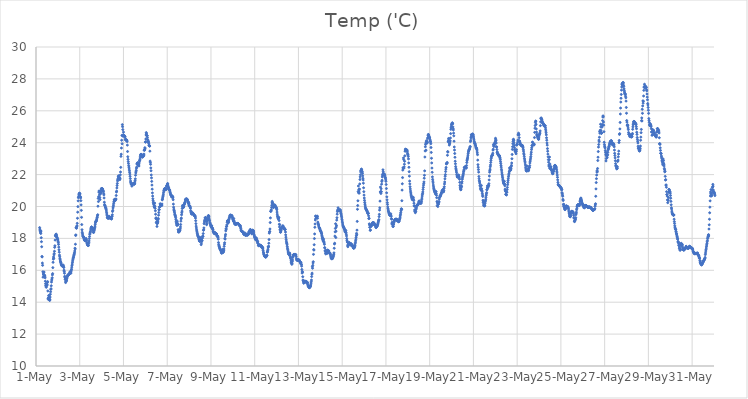
| Category | Temp ('C) |
|---|---|
| 44317.166666666664 | 18.677 |
| 44317.177083333336 | 18.579 |
| 44317.1875 | 18.491 |
| 44317.197916666664 | 18.44 |
| 44317.208333333336 | 18.362 |
| 44317.21875 | 18.308 |
| 44317.229166666664 | 18.458 |
| 44317.239583333336 | 18.043 |
| 44317.25 | 17.794 |
| 44317.260416666664 | 17.476 |
| 44317.270833333336 | 16.867 |
| 44317.28125 | 16.838 |
| 44317.291666666664 | 16.454 |
| 44317.302083333336 | 16.313 |
| 44317.3125 | 15.905 |
| 44317.322916666664 | 15.569 |
| 44317.333333333336 | 15.77 |
| 44317.34375 | 15.732 |
| 44317.354166666664 | 15.859 |
| 44317.364583333336 | 15.897 |
| 44317.375 | 15.663 |
| 44317.385416666664 | 15.684 |
| 44317.395833333336 | 15.685 |
| 44317.40625 | 15.631 |
| 44317.416666666664 | 15.531 |
| 44317.427083333336 | 15.315 |
| 44317.4375 | 15.16 |
| 44317.447916666664 | 15.05 |
| 44317.458333333336 | 15.002 |
| 44317.46875 | 14.934 |
| 44317.479166666664 | 15.065 |
| 44317.489583333336 | 15.076 |
| 44317.5 | 15.052 |
| 44317.510416666664 | 15.119 |
| 44317.520833333336 | 15.241 |
| 44317.53125 | 15.29 |
| 44317.541666666664 | 14.705 |
| 44317.552083333336 | 14.24 |
| 44317.5625 | 14.177 |
| 44317.572916666664 | 14.291 |
| 44317.583333333336 | 14.421 |
| 44317.59375 | 14.397 |
| 44317.604166666664 | 14.224 |
| 44317.614583333336 | 14.148 |
| 44317.625 | 14.11 |
| 44317.635416666664 | 14.159 |
| 44317.645833333336 | 14.323 |
| 44317.65625 | 14.5 |
| 44317.666666666664 | 14.655 |
| 44317.677083333336 | 14.805 |
| 44317.6875 | 14.842 |
| 44317.697916666664 | 15.029 |
| 44317.708333333336 | 15.264 |
| 44317.71875 | 15.386 |
| 44317.729166666664 | 15.455 |
| 44317.739583333336 | 15.531 |
| 44317.75 | 15.712 |
| 44317.760416666664 | 15.792 |
| 44317.770833333336 | 16.167 |
| 44317.78125 | 16.5 |
| 44317.791666666664 | 16.7 |
| 44317.802083333336 | 16.832 |
| 44317.8125 | 16.751 |
| 44317.822916666664 | 16.969 |
| 44317.833333333336 | 17.05 |
| 44317.84375 | 17.194 |
| 44317.854166666664 | 17.439 |
| 44317.864583333336 | 17.538 |
| 44317.875 | 17.896 |
| 44317.885416666664 | 18.163 |
| 44317.895833333336 | 18.164 |
| 44317.90625 | 18.252 |
| 44317.916666666664 | 18.205 |
| 44317.927083333336 | 18.265 |
| 44317.9375 | 18.192 |
| 44317.947916666664 | 18.086 |
| 44317.958333333336 | 18.078 |
| 44317.96875 | 18.038 |
| 44317.979166666664 | 17.96 |
| 44317.989583333336 | 17.947 |
| 44318.0 | 17.897 |
| 44318.010416666664 | 17.813 |
| 44318.020833333336 | 17.74 |
| 44318.03125 | 17.624 |
| 44318.041666666664 | 17.453 |
| 44318.052083333336 | 17.288 |
| 44318.0625 | 17.136 |
| 44318.072916666664 | 16.953 |
| 44318.083333333336 | 16.853 |
| 44318.09375 | 16.735 |
| 44318.104166666664 | 16.659 |
| 44318.114583333336 | 16.578 |
| 44318.125 | 16.524 |
| 44318.135416666664 | 16.486 |
| 44318.145833333336 | 16.436 |
| 44318.15625 | 16.375 |
| 44318.166666666664 | 16.337 |
| 44318.177083333336 | 16.293 |
| 44318.1875 | 16.278 |
| 44318.197916666664 | 16.284 |
| 44318.208333333336 | 16.29 |
| 44318.21875 | 16.282 |
| 44318.229166666664 | 16.273 |
| 44318.239583333336 | 16.264 |
| 44318.25 | 16.321 |
| 44318.260416666664 | 16.212 |
| 44318.270833333336 | 16.175 |
| 44318.28125 | 16.006 |
| 44318.291666666664 | 15.925 |
| 44318.302083333336 | 15.816 |
| 44318.3125 | 15.622 |
| 44318.322916666664 | 15.561 |
| 44318.333333333336 | 15.423 |
| 44318.34375 | 15.464 |
| 44318.354166666664 | 15.23 |
| 44318.364583333336 | 15.313 |
| 44318.375 | 15.311 |
| 44318.385416666664 | 15.379 |
| 44318.395833333336 | 15.35 |
| 44318.40625 | 15.462 |
| 44318.416666666664 | 15.514 |
| 44318.427083333336 | 15.584 |
| 44318.4375 | 15.651 |
| 44318.447916666664 | 15.689 |
| 44318.458333333336 | 15.677 |
| 44318.46875 | 15.707 |
| 44318.479166666664 | 15.693 |
| 44318.489583333336 | 15.729 |
| 44318.5 | 15.754 |
| 44318.510416666664 | 15.754 |
| 44318.520833333336 | 15.782 |
| 44318.53125 | 15.784 |
| 44318.541666666664 | 15.826 |
| 44318.552083333336 | 15.865 |
| 44318.5625 | 15.91 |
| 44318.572916666664 | 15.917 |
| 44318.583333333336 | 15.834 |
| 44318.59375 | 15.816 |
| 44318.604166666664 | 15.905 |
| 44318.614583333336 | 16.013 |
| 44318.625 | 16.072 |
| 44318.635416666664 | 16.198 |
| 44318.645833333336 | 16.305 |
| 44318.65625 | 16.391 |
| 44318.666666666664 | 16.498 |
| 44318.677083333336 | 16.594 |
| 44318.6875 | 16.686 |
| 44318.697916666664 | 16.755 |
| 44318.708333333336 | 16.8 |
| 44318.71875 | 16.843 |
| 44318.729166666664 | 16.929 |
| 44318.739583333336 | 16.977 |
| 44318.75 | 17.029 |
| 44318.760416666664 | 17.102 |
| 44318.770833333336 | 17.208 |
| 44318.78125 | 17.385 |
| 44318.791666666664 | 17.338 |
| 44318.802083333336 | 17.634 |
| 44318.8125 | 18.183 |
| 44318.822916666664 | 18.221 |
| 44318.833333333336 | 18.662 |
| 44318.84375 | 18.688 |
| 44318.854166666664 | 18.637 |
| 44318.864583333336 | 18.755 |
| 44318.875 | 18.792 |
| 44318.885416666664 | 18.944 |
| 44318.895833333336 | 19.263 |
| 44318.90625 | 19.645 |
| 44318.916666666664 | 19.993 |
| 44318.927083333336 | 20.353 |
| 44318.9375 | 20.553 |
| 44318.947916666664 | 20.607 |
| 44318.958333333336 | 20.723 |
| 44318.96875 | 20.783 |
| 44318.979166666664 | 20.824 |
| 44318.989583333336 | 20.832 |
| 44319.0 | 20.809 |
| 44319.010416666664 | 20.782 |
| 44319.020833333336 | 20.631 |
| 44319.03125 | 20.591 |
| 44319.041666666664 | 20.541 |
| 44319.052083333336 | 20.365 |
| 44319.0625 | 20.101 |
| 44319.072916666664 | 19.757 |
| 44319.083333333336 | 19.32 |
| 44319.09375 | 18.866 |
| 44319.104166666664 | 18.545 |
| 44319.114583333336 | 18.383 |
| 44319.125 | 18.288 |
| 44319.135416666664 | 18.203 |
| 44319.145833333336 | 18.134 |
| 44319.15625 | 18.099 |
| 44319.166666666664 | 18.102 |
| 44319.177083333336 | 18.084 |
| 44319.1875 | 18.035 |
| 44319.197916666664 | 17.977 |
| 44319.208333333336 | 17.935 |
| 44319.21875 | 17.895 |
| 44319.229166666664 | 17.867 |
| 44319.239583333336 | 17.864 |
| 44319.25 | 17.877 |
| 44319.260416666664 | 17.89 |
| 44319.270833333336 | 17.885 |
| 44319.28125 | 17.949 |
| 44319.291666666664 | 17.996 |
| 44319.302083333336 | 17.928 |
| 44319.3125 | 17.847 |
| 44319.322916666664 | 17.727 |
| 44319.333333333336 | 17.703 |
| 44319.34375 | 17.642 |
| 44319.354166666664 | 17.605 |
| 44319.364583333336 | 17.581 |
| 44319.375 | 17.579 |
| 44319.385416666664 | 17.561 |
| 44319.395833333336 | 17.553 |
| 44319.40625 | 17.673 |
| 44319.416666666664 | 17.75 |
| 44319.427083333336 | 17.842 |
| 44319.4375 | 17.986 |
| 44319.447916666664 | 18.115 |
| 44319.458333333336 | 18.254 |
| 44319.46875 | 18.324 |
| 44319.479166666664 | 18.389 |
| 44319.489583333336 | 18.428 |
| 44319.5 | 18.527 |
| 44319.510416666664 | 18.611 |
| 44319.520833333336 | 18.664 |
| 44319.53125 | 18.704 |
| 44319.541666666664 | 18.713 |
| 44319.552083333336 | 18.701 |
| 44319.5625 | 18.656 |
| 44319.572916666664 | 18.643 |
| 44319.583333333336 | 18.632 |
| 44319.59375 | 18.598 |
| 44319.604166666664 | 18.564 |
| 44319.614583333336 | 18.493 |
| 44319.625 | 18.376 |
| 44319.635416666664 | 18.375 |
| 44319.645833333336 | 18.45 |
| 44319.65625 | 18.518 |
| 44319.666666666664 | 18.536 |
| 44319.677083333336 | 18.616 |
| 44319.6875 | 18.69 |
| 44319.697916666664 | 18.769 |
| 44319.708333333336 | 18.888 |
| 44319.71875 | 18.988 |
| 44319.729166666664 | 19.05 |
| 44319.739583333336 | 19.078 |
| 44319.75 | 19.083 |
| 44319.760416666664 | 19.105 |
| 44319.770833333336 | 19.162 |
| 44319.78125 | 19.225 |
| 44319.791666666664 | 19.309 |
| 44319.802083333336 | 19.344 |
| 44319.8125 | 19.441 |
| 44319.822916666664 | 19.482 |
| 44319.833333333336 | 20.018 |
| 44319.84375 | 20.508 |
| 44319.854166666664 | 20.31 |
| 44319.864583333336 | 20.626 |
| 44319.875 | 20.895 |
| 44319.885416666664 | 20.977 |
| 44319.895833333336 | 20.927 |
| 44319.90625 | 20.754 |
| 44319.916666666664 | 20.564 |
| 44319.927083333336 | 20.433 |
| 44319.9375 | 20.772 |
| 44319.947916666664 | 20.917 |
| 44319.958333333336 | 20.886 |
| 44319.96875 | 20.849 |
| 44319.979166666664 | 21.02 |
| 44319.989583333336 | 21.128 |
| 44320.0 | 21.114 |
| 44320.010416666664 | 21.084 |
| 44320.020833333336 | 21.124 |
| 44320.03125 | 21.116 |
| 44320.041666666664 | 21.102 |
| 44320.052083333336 | 21.043 |
| 44320.0625 | 20.99 |
| 44320.072916666664 | 20.975 |
| 44320.083333333336 | 20.918 |
| 44320.09375 | 20.801 |
| 44320.104166666664 | 20.729 |
| 44320.114583333336 | 20.535 |
| 44320.125 | 20.269 |
| 44320.135416666664 | 20.121 |
| 44320.145833333336 | 20.07 |
| 44320.15625 | 20.044 |
| 44320.166666666664 | 19.972 |
| 44320.177083333336 | 19.944 |
| 44320.1875 | 19.924 |
| 44320.197916666664 | 19.878 |
| 44320.208333333336 | 19.812 |
| 44320.21875 | 19.718 |
| 44320.229166666664 | 19.61 |
| 44320.239583333336 | 19.522 |
| 44320.25 | 19.435 |
| 44320.260416666664 | 19.324 |
| 44320.270833333336 | 19.288 |
| 44320.28125 | 19.284 |
| 44320.291666666664 | 19.274 |
| 44320.302083333336 | 19.283 |
| 44320.3125 | 19.277 |
| 44320.322916666664 | 19.271 |
| 44320.333333333336 | 19.36 |
| 44320.34375 | 19.387 |
| 44320.354166666664 | 19.316 |
| 44320.364583333336 | 19.313 |
| 44320.375 | 19.285 |
| 44320.385416666664 | 19.27 |
| 44320.395833333336 | 19.291 |
| 44320.40625 | 19.252 |
| 44320.416666666664 | 19.254 |
| 44320.427083333336 | 19.253 |
| 44320.4375 | 19.226 |
| 44320.447916666664 | 19.226 |
| 44320.458333333336 | 19.234 |
| 44320.46875 | 19.36 |
| 44320.479166666664 | 19.395 |
| 44320.489583333336 | 19.482 |
| 44320.5 | 19.687 |
| 44320.510416666664 | 19.761 |
| 44320.520833333336 | 19.908 |
| 44320.53125 | 19.987 |
| 44320.541666666664 | 20.087 |
| 44320.552083333336 | 20.202 |
| 44320.5625 | 20.301 |
| 44320.572916666664 | 20.415 |
| 44320.583333333336 | 20.336 |
| 44320.59375 | 20.447 |
| 44320.604166666664 | 20.435 |
| 44320.614583333336 | 20.41 |
| 44320.625 | 20.374 |
| 44320.635416666664 | 20.441 |
| 44320.645833333336 | 20.44 |
| 44320.65625 | 20.475 |
| 44320.666666666664 | 20.691 |
| 44320.677083333336 | 20.911 |
| 44320.6875 | 20.962 |
| 44320.697916666664 | 21.162 |
| 44320.708333333336 | 21.315 |
| 44320.71875 | 21.445 |
| 44320.729166666664 | 21.605 |
| 44320.739583333336 | 21.681 |
| 44320.75 | 21.749 |
| 44320.760416666664 | 21.86 |
| 44320.770833333336 | 21.924 |
| 44320.78125 | 21.859 |
| 44320.791666666664 | 21.853 |
| 44320.802083333336 | 21.812 |
| 44320.8125 | 21.754 |
| 44320.822916666664 | 21.737 |
| 44320.833333333336 | 21.684 |
| 44320.84375 | 21.77 |
| 44320.854166666664 | 21.981 |
| 44320.864583333336 | 22.164 |
| 44320.875 | 22.454 |
| 44320.885416666664 | 23.143 |
| 44320.895833333336 | 23.278 |
| 44320.90625 | 23.666 |
| 44320.916666666664 | 24.155 |
| 44320.927083333336 | 24.455 |
| 44320.9375 | 23.933 |
| 44320.947916666664 | 25.132 |
| 44320.958333333336 | 25.004 |
| 44320.96875 | 24.82 |
| 44320.979166666664 | 24.402 |
| 44320.989583333336 | 24.502 |
| 44321.0 | 24.663 |
| 44321.010416666664 | 24.446 |
| 44321.020833333336 | 24.422 |
| 44321.03125 | 24.451 |
| 44321.041666666664 | 24.435 |
| 44321.052083333336 | 24.402 |
| 44321.0625 | 24.389 |
| 44321.072916666664 | 24.359 |
| 44321.083333333336 | 24.22 |
| 44321.09375 | 24.177 |
| 44321.104166666664 | 24.178 |
| 44321.114583333336 | 24.172 |
| 44321.125 | 24.174 |
| 44321.135416666664 | 24.173 |
| 44321.145833333336 | 24.166 |
| 44321.15625 | 24.148 |
| 44321.166666666664 | 24.072 |
| 44321.177083333336 | 23.848 |
| 44321.1875 | 23.449 |
| 44321.197916666664 | 23.119 |
| 44321.208333333336 | 22.955 |
| 44321.21875 | 22.814 |
| 44321.229166666664 | 22.693 |
| 44321.239583333336 | 22.56 |
| 44321.25 | 22.462 |
| 44321.260416666664 | 22.352 |
| 44321.270833333336 | 22.251 |
| 44321.28125 | 22.141 |
| 44321.291666666664 | 22.032 |
| 44321.302083333336 | 21.892 |
| 44321.3125 | 21.748 |
| 44321.322916666664 | 21.595 |
| 44321.333333333336 | 21.507 |
| 44321.34375 | 21.456 |
| 44321.354166666664 | 21.401 |
| 44321.364583333336 | 21.398 |
| 44321.375 | 21.366 |
| 44321.385416666664 | 21.275 |
| 44321.395833333336 | 21.412 |
| 44321.40625 | 21.395 |
| 44321.416666666664 | 21.391 |
| 44321.427083333336 | 21.398 |
| 44321.4375 | 21.415 |
| 44321.447916666664 | 21.427 |
| 44321.458333333336 | 21.424 |
| 44321.46875 | 21.44 |
| 44321.479166666664 | 21.41 |
| 44321.489583333336 | 21.396 |
| 44321.5 | 21.413 |
| 44321.510416666664 | 21.439 |
| 44321.520833333336 | 21.537 |
| 44321.53125 | 21.62 |
| 44321.541666666664 | 21.735 |
| 44321.552083333336 | 21.957 |
| 44321.5625 | 22.103 |
| 44321.572916666664 | 22.176 |
| 44321.583333333336 | 22.271 |
| 44321.59375 | 22.403 |
| 44321.604166666664 | 22.47 |
| 44321.614583333336 | 22.66 |
| 44321.625 | 22.694 |
| 44321.635416666664 | 22.725 |
| 44321.645833333336 | 22.744 |
| 44321.65625 | 22.654 |
| 44321.666666666664 | 22.621 |
| 44321.677083333336 | 22.605 |
| 44321.6875 | 22.601 |
| 44321.697916666664 | 22.612 |
| 44321.708333333336 | 22.54 |
| 44321.71875 | 22.728 |
| 44321.729166666664 | 22.849 |
| 44321.739583333336 | 22.884 |
| 44321.75 | 22.948 |
| 44321.760416666664 | 23.036 |
| 44321.770833333336 | 23.138 |
| 44321.78125 | 23.208 |
| 44321.791666666664 | 23.26 |
| 44321.802083333336 | 23.273 |
| 44321.8125 | 23.265 |
| 44321.822916666664 | 23.23 |
| 44321.833333333336 | 23.143 |
| 44321.84375 | 23.113 |
| 44321.854166666664 | 23.122 |
| 44321.864583333336 | 23.116 |
| 44321.875 | 23.105 |
| 44321.885416666664 | 23.114 |
| 44321.895833333336 | 23.165 |
| 44321.90625 | 23.252 |
| 44321.916666666664 | 23.164 |
| 44321.927083333336 | 23.198 |
| 44321.9375 | 23.284 |
| 44321.947916666664 | 23.52 |
| 44321.958333333336 | 23.567 |
| 44321.96875 | 23.542 |
| 44321.979166666664 | 23.687 |
| 44321.989583333336 | 23.618 |
| 44322.0 | 24.052 |
| 44322.010416666664 | 24.038 |
| 44322.020833333336 | 24.231 |
| 44322.03125 | 24.485 |
| 44322.041666666664 | 24.635 |
| 44322.052083333336 | 24.573 |
| 44322.0625 | 24.447 |
| 44322.072916666664 | 24.44 |
| 44322.083333333336 | 24.44 |
| 44322.09375 | 24.327 |
| 44322.104166666664 | 24.197 |
| 44322.114583333336 | 24.145 |
| 44322.125 | 24.108 |
| 44322.135416666664 | 24.06 |
| 44322.145833333336 | 24.029 |
| 44322.15625 | 23.945 |
| 44322.166666666664 | 23.843 |
| 44322.177083333336 | 23.824 |
| 44322.1875 | 23.8 |
| 44322.197916666664 | 23.785 |
| 44322.208333333336 | 23.47 |
| 44322.21875 | 22.845 |
| 44322.229166666664 | 22.761 |
| 44322.239583333336 | 22.645 |
| 44322.25 | 22.418 |
| 44322.260416666664 | 22.239 |
| 44322.270833333336 | 21.977 |
| 44322.28125 | 21.794 |
| 44322.291666666664 | 21.575 |
| 44322.302083333336 | 21.344 |
| 44322.3125 | 21.088 |
| 44322.322916666664 | 20.853 |
| 44322.333333333336 | 20.655 |
| 44322.34375 | 20.486 |
| 44322.354166666664 | 20.365 |
| 44322.364583333336 | 20.259 |
| 44322.375 | 20.195 |
| 44322.385416666664 | 20.126 |
| 44322.395833333336 | 20.028 |
| 44322.40625 | 19.977 |
| 44322.416666666664 | 19.946 |
| 44322.427083333336 | 20.215 |
| 44322.4375 | 20.02 |
| 44322.447916666664 | 19.885 |
| 44322.458333333336 | 19.732 |
| 44322.46875 | 19.516 |
| 44322.479166666664 | 19.246 |
| 44322.489583333336 | 19.291 |
| 44322.5 | 18.987 |
| 44322.510416666664 | 19.221 |
| 44322.520833333336 | 19.064 |
| 44322.53125 | 18.751 |
| 44322.541666666664 | 18.92 |
| 44322.552083333336 | 18.948 |
| 44322.5625 | 19.049 |
| 44322.572916666664 | 19.026 |
| 44322.583333333336 | 19.173 |
| 44322.59375 | 19.248 |
| 44322.604166666664 | 19.456 |
| 44322.614583333336 | 19.625 |
| 44322.625 | 19.798 |
| 44322.635416666664 | 19.808 |
| 44322.645833333336 | 19.963 |
| 44322.65625 | 19.993 |
| 44322.666666666664 | 19.984 |
| 44322.677083333336 | 20.175 |
| 44322.6875 | 20.123 |
| 44322.697916666664 | 20.11 |
| 44322.708333333336 | 20.133 |
| 44322.71875 | 20.102 |
| 44322.729166666664 | 20.103 |
| 44322.739583333336 | 20.078 |
| 44322.75 | 20.059 |
| 44322.760416666664 | 20.158 |
| 44322.770833333336 | 20.414 |
| 44322.78125 | 20.456 |
| 44322.791666666664 | 20.537 |
| 44322.802083333336 | 20.611 |
| 44322.8125 | 20.675 |
| 44322.822916666664 | 20.771 |
| 44322.833333333336 | 20.88 |
| 44322.84375 | 20.975 |
| 44322.854166666664 | 21.024 |
| 44322.864583333336 | 21.088 |
| 44322.875 | 21.105 |
| 44322.885416666664 | 21.123 |
| 44322.895833333336 | 21.122 |
| 44322.90625 | 21.115 |
| 44322.916666666664 | 21.095 |
| 44322.927083333336 | 21.047 |
| 44322.9375 | 21.075 |
| 44322.947916666664 | 21.089 |
| 44322.958333333336 | 21.108 |
| 44322.96875 | 21.273 |
| 44322.979166666664 | 21.288 |
| 44322.989583333336 | 21.319 |
| 44323.0 | 21.35 |
| 44323.010416666664 | 21.414 |
| 44323.020833333336 | 21.441 |
| 44323.03125 | 21.34 |
| 44323.041666666664 | 21.26 |
| 44323.052083333336 | 21.175 |
| 44323.0625 | 21.187 |
| 44323.072916666664 | 21.093 |
| 44323.083333333336 | 21.06 |
| 44323.09375 | 21.071 |
| 44323.104166666664 | 21.045 |
| 44323.114583333336 | 20.988 |
| 44323.125 | 20.913 |
| 44323.135416666664 | 20.892 |
| 44323.145833333336 | 20.811 |
| 44323.15625 | 20.754 |
| 44323.166666666664 | 20.724 |
| 44323.177083333336 | 20.698 |
| 44323.1875 | 20.697 |
| 44323.197916666664 | 20.625 |
| 44323.208333333336 | 20.591 |
| 44323.21875 | 20.612 |
| 44323.229166666664 | 20.633 |
| 44323.239583333336 | 20.641 |
| 44323.25 | 20.614 |
| 44323.260416666664 | 20.548 |
| 44323.270833333336 | 20.424 |
| 44323.28125 | 20.151 |
| 44323.291666666664 | 19.958 |
| 44323.302083333336 | 19.835 |
| 44323.3125 | 19.753 |
| 44323.322916666664 | 19.712 |
| 44323.333333333336 | 19.632 |
| 44323.34375 | 19.527 |
| 44323.354166666664 | 19.478 |
| 44323.364583333336 | 19.444 |
| 44323.375 | 19.386 |
| 44323.385416666664 | 19.308 |
| 44323.395833333336 | 19.194 |
| 44323.40625 | 19.077 |
| 44323.416666666664 | 18.982 |
| 44323.427083333336 | 18.91 |
| 44323.4375 | 18.839 |
| 44323.447916666664 | 18.815 |
| 44323.458333333336 | 19.079 |
| 44323.46875 | 18.942 |
| 44323.479166666664 | 18.913 |
| 44323.489583333336 | 18.844 |
| 44323.5 | 18.549 |
| 44323.510416666664 | 18.399 |
| 44323.520833333336 | 18.488 |
| 44323.53125 | 18.42 |
| 44323.541666666664 | 18.398 |
| 44323.552083333336 | 18.501 |
| 44323.5625 | 18.467 |
| 44323.572916666664 | 18.48 |
| 44323.583333333336 | 18.524 |
| 44323.59375 | 18.605 |
| 44323.604166666664 | 18.718 |
| 44323.614583333336 | 18.87 |
| 44323.625 | 19.081 |
| 44323.635416666664 | 19.225 |
| 44323.645833333336 | 19.276 |
| 44323.65625 | 19.48 |
| 44323.666666666664 | 19.608 |
| 44323.677083333336 | 19.709 |
| 44323.6875 | 19.875 |
| 44323.697916666664 | 20.061 |
| 44323.708333333336 | 19.977 |
| 44323.71875 | 19.996 |
| 44323.729166666664 | 19.947 |
| 44323.739583333336 | 19.938 |
| 44323.75 | 19.988 |
| 44323.760416666664 | 20.033 |
| 44323.770833333336 | 20.137 |
| 44323.78125 | 20.123 |
| 44323.791666666664 | 20.188 |
| 44323.802083333336 | 20.226 |
| 44323.8125 | 20.264 |
| 44323.822916666664 | 20.339 |
| 44323.833333333336 | 20.429 |
| 44323.84375 | 20.449 |
| 44323.854166666664 | 20.465 |
| 44323.864583333336 | 20.468 |
| 44323.875 | 20.467 |
| 44323.885416666664 | 20.459 |
| 44323.895833333336 | 20.462 |
| 44323.90625 | 20.465 |
| 44323.916666666664 | 20.434 |
| 44323.927083333336 | 20.4 |
| 44323.9375 | 20.34 |
| 44323.947916666664 | 20.292 |
| 44323.958333333336 | 20.234 |
| 44323.96875 | 20.173 |
| 44323.979166666664 | 20.264 |
| 44323.989583333336 | 20.196 |
| 44324.0 | 20.072 |
| 44324.010416666664 | 20.05 |
| 44324.020833333336 | 20.041 |
| 44324.03125 | 20.034 |
| 44324.041666666664 | 20.006 |
| 44324.052083333336 | 19.954 |
| 44324.0625 | 19.89 |
| 44324.072916666664 | 19.744 |
| 44324.083333333336 | 19.67 |
| 44324.09375 | 19.614 |
| 44324.104166666664 | 19.545 |
| 44324.114583333336 | 19.536 |
| 44324.125 | 19.538 |
| 44324.135416666664 | 19.559 |
| 44324.145833333336 | 19.595 |
| 44324.15625 | 19.598 |
| 44324.166666666664 | 19.595 |
| 44324.177083333336 | 19.543 |
| 44324.1875 | 19.558 |
| 44324.197916666664 | 19.504 |
| 44324.208333333336 | 19.492 |
| 44324.21875 | 19.492 |
| 44324.229166666664 | 19.441 |
| 44324.239583333336 | 19.424 |
| 44324.25 | 19.437 |
| 44324.260416666664 | 19.427 |
| 44324.270833333336 | 19.406 |
| 44324.28125 | 19.356 |
| 44324.291666666664 | 19.273 |
| 44324.302083333336 | 19.11 |
| 44324.3125 | 18.927 |
| 44324.322916666664 | 18.77 |
| 44324.333333333336 | 18.653 |
| 44324.34375 | 18.536 |
| 44324.354166666664 | 18.461 |
| 44324.364583333336 | 18.396 |
| 44324.375 | 18.318 |
| 44324.385416666664 | 18.246 |
| 44324.395833333336 | 18.178 |
| 44324.40625 | 18.145 |
| 44324.416666666664 | 18.126 |
| 44324.427083333336 | 18.088 |
| 44324.4375 | 18.048 |
| 44324.447916666664 | 17.973 |
| 44324.458333333336 | 17.919 |
| 44324.46875 | 17.854 |
| 44324.479166666664 | 17.825 |
| 44324.489583333336 | 17.816 |
| 44324.5 | 17.969 |
| 44324.510416666664 | 18.052 |
| 44324.520833333336 | 17.947 |
| 44324.53125 | 17.945 |
| 44324.541666666664 | 17.935 |
| 44324.552083333336 | 17.607 |
| 44324.5625 | 17.71 |
| 44324.572916666664 | 17.855 |
| 44324.583333333336 | 17.86 |
| 44324.59375 | 17.848 |
| 44324.604166666664 | 18.005 |
| 44324.614583333336 | 18.113 |
| 44324.625 | 18.14 |
| 44324.635416666664 | 18.129 |
| 44324.645833333336 | 18.302 |
| 44324.65625 | 18.506 |
| 44324.666666666664 | 18.543 |
| 44324.677083333336 | 18.657 |
| 44324.6875 | 18.92 |
| 44324.697916666664 | 19.027 |
| 44324.708333333336 | 19.144 |
| 44324.71875 | 19.093 |
| 44324.729166666664 | 19.286 |
| 44324.739583333336 | 19.282 |
| 44324.75 | 19.298 |
| 44324.760416666664 | 19.314 |
| 44324.770833333336 | 19.225 |
| 44324.78125 | 19.15 |
| 44324.791666666664 | 19.048 |
| 44324.802083333336 | 18.859 |
| 44324.8125 | 18.919 |
| 44324.822916666664 | 19.06 |
| 44324.833333333336 | 19.131 |
| 44324.84375 | 19.179 |
| 44324.854166666664 | 19.222 |
| 44324.864583333336 | 19.335 |
| 44324.875 | 19.414 |
| 44324.885416666664 | 19.429 |
| 44324.895833333336 | 19.416 |
| 44324.90625 | 19.372 |
| 44324.916666666664 | 19.272 |
| 44324.927083333336 | 19.16 |
| 44324.9375 | 19.105 |
| 44324.947916666664 | 18.997 |
| 44324.958333333336 | 18.953 |
| 44324.96875 | 18.907 |
| 44324.979166666664 | 18.849 |
| 44324.989583333336 | 18.803 |
| 44325.0 | 18.739 |
| 44325.010416666664 | 18.718 |
| 44325.020833333336 | 18.772 |
| 44325.03125 | 18.8 |
| 44325.041666666664 | 18.659 |
| 44325.052083333336 | 18.65 |
| 44325.0625 | 18.661 |
| 44325.072916666664 | 18.614 |
| 44325.083333333336 | 18.569 |
| 44325.09375 | 18.526 |
| 44325.104166666664 | 18.434 |
| 44325.114583333336 | 18.419 |
| 44325.125 | 18.392 |
| 44325.135416666664 | 18.317 |
| 44325.145833333336 | 18.342 |
| 44325.15625 | 18.371 |
| 44325.166666666664 | 18.294 |
| 44325.177083333336 | 18.358 |
| 44325.1875 | 18.346 |
| 44325.197916666664 | 18.336 |
| 44325.208333333336 | 18.319 |
| 44325.21875 | 18.304 |
| 44325.229166666664 | 18.257 |
| 44325.239583333336 | 18.296 |
| 44325.25 | 18.287 |
| 44325.260416666664 | 18.272 |
| 44325.270833333336 | 18.151 |
| 44325.28125 | 18.154 |
| 44325.291666666664 | 18.168 |
| 44325.302083333336 | 18.151 |
| 44325.3125 | 18.116 |
| 44325.322916666664 | 18.047 |
| 44325.333333333336 | 17.951 |
| 44325.34375 | 17.737 |
| 44325.354166666664 | 17.618 |
| 44325.364583333336 | 17.546 |
| 44325.375 | 17.501 |
| 44325.385416666664 | 17.453 |
| 44325.395833333336 | 17.401 |
| 44325.40625 | 17.362 |
| 44325.416666666664 | 17.331 |
| 44325.427083333336 | 17.307 |
| 44325.4375 | 17.28 |
| 44325.447916666664 | 17.256 |
| 44325.458333333336 | 17.203 |
| 44325.46875 | 17.147 |
| 44325.479166666664 | 17.108 |
| 44325.489583333336 | 17.077 |
| 44325.5 | 17.077 |
| 44325.510416666664 | 17.15 |
| 44325.520833333336 | 17.224 |
| 44325.53125 | 17.31 |
| 44325.541666666664 | 17.213 |
| 44325.552083333336 | 17.123 |
| 44325.5625 | 17.132 |
| 44325.572916666664 | 17.197 |
| 44325.583333333336 | 17.236 |
| 44325.59375 | 17.336 |
| 44325.604166666664 | 17.502 |
| 44325.614583333336 | 17.633 |
| 44325.625 | 17.729 |
| 44325.635416666664 | 17.997 |
| 44325.645833333336 | 17.954 |
| 44325.65625 | 18.149 |
| 44325.666666666664 | 18.251 |
| 44325.677083333336 | 18.473 |
| 44325.6875 | 18.602 |
| 44325.697916666664 | 18.582 |
| 44325.708333333336 | 18.74 |
| 44325.71875 | 18.758 |
| 44325.729166666664 | 18.855 |
| 44325.739583333336 | 19.016 |
| 44325.75 | 19.093 |
| 44325.760416666664 | 19.108 |
| 44325.770833333336 | 19.084 |
| 44325.78125 | 19 |
| 44325.791666666664 | 18.975 |
| 44325.802083333336 | 19.008 |
| 44325.8125 | 19.086 |
| 44325.822916666664 | 19.175 |
| 44325.833333333336 | 19.249 |
| 44325.84375 | 19.311 |
| 44325.854166666664 | 19.356 |
| 44325.864583333336 | 19.434 |
| 44325.875 | 19.456 |
| 44325.885416666664 | 19.462 |
| 44325.895833333336 | 19.447 |
| 44325.90625 | 19.426 |
| 44325.916666666664 | 19.43 |
| 44325.927083333336 | 19.442 |
| 44325.9375 | 19.432 |
| 44325.947916666664 | 19.437 |
| 44325.958333333336 | 19.415 |
| 44325.96875 | 19.373 |
| 44325.979166666664 | 19.317 |
| 44325.989583333336 | 19.266 |
| 44326.0 | 19.209 |
| 44326.010416666664 | 19.179 |
| 44326.020833333336 | 19.116 |
| 44326.03125 | 19.063 |
| 44326.041666666664 | 19.247 |
| 44326.052083333336 | 19.1 |
| 44326.0625 | 19.059 |
| 44326.072916666664 | 18.964 |
| 44326.083333333336 | 18.936 |
| 44326.09375 | 18.891 |
| 44326.104166666664 | 18.892 |
| 44326.114583333336 | 18.906 |
| 44326.125 | 18.908 |
| 44326.135416666664 | 18.873 |
| 44326.145833333336 | 18.9 |
| 44326.15625 | 18.89 |
| 44326.166666666664 | 18.926 |
| 44326.177083333336 | 18.928 |
| 44326.1875 | 18.937 |
| 44326.197916666664 | 18.932 |
| 44326.208333333336 | 18.934 |
| 44326.21875 | 18.936 |
| 44326.229166666664 | 18.941 |
| 44326.239583333336 | 18.933 |
| 44326.25 | 18.914 |
| 44326.260416666664 | 18.893 |
| 44326.270833333336 | 18.875 |
| 44326.28125 | 18.851 |
| 44326.291666666664 | 18.825 |
| 44326.302083333336 | 18.809 |
| 44326.3125 | 18.808 |
| 44326.322916666664 | 18.817 |
| 44326.333333333336 | 18.814 |
| 44326.34375 | 18.76 |
| 44326.354166666664 | 18.693 |
| 44326.364583333336 | 18.609 |
| 44326.375 | 18.524 |
| 44326.385416666664 | 18.498 |
| 44326.395833333336 | 18.459 |
| 44326.40625 | 18.44 |
| 44326.416666666664 | 18.435 |
| 44326.427083333336 | 18.428 |
| 44326.4375 | 18.414 |
| 44326.447916666664 | 18.405 |
| 44326.458333333336 | 18.408 |
| 44326.46875 | 18.399 |
| 44326.479166666664 | 18.368 |
| 44326.489583333336 | 18.314 |
| 44326.5 | 18.277 |
| 44326.510416666664 | 18.256 |
| 44326.520833333336 | 18.248 |
| 44326.53125 | 18.239 |
| 44326.541666666664 | 18.24 |
| 44326.552083333336 | 18.342 |
| 44326.5625 | 18.234 |
| 44326.572916666664 | 18.207 |
| 44326.583333333336 | 18.191 |
| 44326.59375 | 18.207 |
| 44326.604166666664 | 18.209 |
| 44326.614583333336 | 18.244 |
| 44326.625 | 18.258 |
| 44326.635416666664 | 18.216 |
| 44326.645833333336 | 18.216 |
| 44326.65625 | 18.2 |
| 44326.666666666664 | 18.207 |
| 44326.677083333336 | 18.261 |
| 44326.6875 | 18.254 |
| 44326.697916666664 | 18.229 |
| 44326.708333333336 | 18.258 |
| 44326.71875 | 18.28 |
| 44326.729166666664 | 18.355 |
| 44326.739583333336 | 18.423 |
| 44326.75 | 18.448 |
| 44326.760416666664 | 18.38 |
| 44326.770833333336 | 18.424 |
| 44326.78125 | 18.431 |
| 44326.791666666664 | 18.542 |
| 44326.802083333336 | 18.557 |
| 44326.8125 | 18.518 |
| 44326.822916666664 | 18.49 |
| 44326.833333333336 | 18.47 |
| 44326.84375 | 18.446 |
| 44326.854166666664 | 18.328 |
| 44326.864583333336 | 18.289 |
| 44326.875 | 18.337 |
| 44326.885416666664 | 18.424 |
| 44326.895833333336 | 18.461 |
| 44326.90625 | 18.513 |
| 44326.916666666664 | 18.513 |
| 44326.927083333336 | 18.491 |
| 44326.9375 | 18.476 |
| 44326.947916666664 | 18.426 |
| 44326.958333333336 | 18.343 |
| 44326.96875 | 18.253 |
| 44326.979166666664 | 18.187 |
| 44326.989583333336 | 18.12 |
| 44327.0 | 18.064 |
| 44327.010416666664 | 18.029 |
| 44327.020833333336 | 17.967 |
| 44327.03125 | 17.949 |
| 44327.041666666664 | 17.931 |
| 44327.052083333336 | 17.914 |
| 44327.0625 | 18.031 |
| 44327.072916666664 | 18.024 |
| 44327.083333333336 | 17.959 |
| 44327.09375 | 17.913 |
| 44327.104166666664 | 17.88 |
| 44327.114583333336 | 17.827 |
| 44327.125 | 17.765 |
| 44327.135416666664 | 17.807 |
| 44327.145833333336 | 17.689 |
| 44327.15625 | 17.674 |
| 44327.166666666664 | 17.568 |
| 44327.177083333336 | 17.543 |
| 44327.1875 | 17.555 |
| 44327.197916666664 | 17.55 |
| 44327.208333333336 | 17.568 |
| 44327.21875 | 17.562 |
| 44327.229166666664 | 17.582 |
| 44327.239583333336 | 17.537 |
| 44327.25 | 17.548 |
| 44327.260416666664 | 17.573 |
| 44327.270833333336 | 17.549 |
| 44327.28125 | 17.548 |
| 44327.291666666664 | 17.502 |
| 44327.302083333336 | 17.522 |
| 44327.3125 | 17.515 |
| 44327.322916666664 | 17.433 |
| 44327.333333333336 | 17.431 |
| 44327.34375 | 17.456 |
| 44327.354166666664 | 17.445 |
| 44327.364583333336 | 17.42 |
| 44327.375 | 17.34 |
| 44327.385416666664 | 17.24 |
| 44327.395833333336 | 17.141 |
| 44327.40625 | 17.081 |
| 44327.416666666664 | 17.014 |
| 44327.427083333336 | 16.981 |
| 44327.4375 | 16.949 |
| 44327.447916666664 | 16.91 |
| 44327.458333333336 | 16.875 |
| 44327.46875 | 16.859 |
| 44327.479166666664 | 16.846 |
| 44327.489583333336 | 16.837 |
| 44327.5 | 16.833 |
| 44327.510416666664 | 16.838 |
| 44327.520833333336 | 16.846 |
| 44327.53125 | 16.872 |
| 44327.541666666664 | 16.91 |
| 44327.552083333336 | 16.937 |
| 44327.5625 | 16.945 |
| 44327.572916666664 | 17.136 |
| 44327.583333333336 | 17.155 |
| 44327.59375 | 17.238 |
| 44327.604166666664 | 17.321 |
| 44327.614583333336 | 17.472 |
| 44327.625 | 17.451 |
| 44327.635416666664 | 17.514 |
| 44327.645833333336 | 17.696 |
| 44327.65625 | 17.929 |
| 44327.666666666664 | 18.329 |
| 44327.677083333336 | 18.411 |
| 44327.6875 | 18.437 |
| 44327.697916666664 | 18.591 |
| 44327.708333333336 | 18.993 |
| 44327.71875 | 19.285 |
| 44327.729166666664 | 19.696 |
| 44327.739583333336 | 19.696 |
| 44327.75 | 19.776 |
| 44327.760416666664 | 19.781 |
| 44327.770833333336 | 19.935 |
| 44327.78125 | 20.078 |
| 44327.791666666664 | 20.228 |
| 44327.802083333336 | 20.322 |
| 44327.8125 | 20.221 |
| 44327.822916666664 | 20.208 |
| 44327.833333333336 | 20.087 |
| 44327.84375 | 19.979 |
| 44327.854166666664 | 19.933 |
| 44327.864583333336 | 19.95 |
| 44327.875 | 19.999 |
| 44327.885416666664 | 19.99 |
| 44327.895833333336 | 20.039 |
| 44327.90625 | 20.089 |
| 44327.916666666664 | 20.102 |
| 44327.927083333336 | 20.071 |
| 44327.9375 | 20.029 |
| 44327.947916666664 | 20.004 |
| 44327.958333333336 | 19.984 |
| 44327.96875 | 19.963 |
| 44327.979166666664 | 19.934 |
| 44327.989583333336 | 19.919 |
| 44328.0 | 19.864 |
| 44328.010416666664 | 19.796 |
| 44328.020833333336 | 19.651 |
| 44328.03125 | 19.52 |
| 44328.041666666664 | 19.41 |
| 44328.052083333336 | 19.352 |
| 44328.0625 | 19.298 |
| 44328.072916666664 | 19.242 |
| 44328.083333333336 | 19.226 |
| 44328.09375 | 19.279 |
| 44328.104166666664 | 19.313 |
| 44328.114583333336 | 19.119 |
| 44328.125 | 18.887 |
| 44328.135416666664 | 18.717 |
| 44328.145833333336 | 18.858 |
| 44328.15625 | 18.534 |
| 44328.166666666664 | 18.579 |
| 44328.177083333336 | 18.389 |
| 44328.1875 | 18.394 |
| 44328.197916666664 | 18.587 |
| 44328.208333333336 | 18.475 |
| 44328.21875 | 18.582 |
| 44328.229166666664 | 18.687 |
| 44328.239583333336 | 18.67 |
| 44328.25 | 18.687 |
| 44328.260416666664 | 18.695 |
| 44328.270833333336 | 18.709 |
| 44328.28125 | 18.779 |
| 44328.291666666664 | 18.789 |
| 44328.302083333336 | 18.713 |
| 44328.3125 | 18.684 |
| 44328.322916666664 | 18.672 |
| 44328.333333333336 | 18.674 |
| 44328.34375 | 18.638 |
| 44328.354166666664 | 18.576 |
| 44328.364583333336 | 18.602 |
| 44328.375 | 18.588 |
| 44328.385416666664 | 18.568 |
| 44328.395833333336 | 18.556 |
| 44328.40625 | 18.4 |
| 44328.416666666664 | 18.221 |
| 44328.427083333336 | 18.077 |
| 44328.4375 | 17.941 |
| 44328.447916666664 | 17.827 |
| 44328.458333333336 | 17.726 |
| 44328.46875 | 17.693 |
| 44328.479166666664 | 17.6 |
| 44328.489583333336 | 17.483 |
| 44328.5 | 17.382 |
| 44328.510416666664 | 17.298 |
| 44328.520833333336 | 17.214 |
| 44328.53125 | 17.139 |
| 44328.541666666664 | 17.076 |
| 44328.552083333336 | 17.025 |
| 44328.5625 | 17.002 |
| 44328.572916666664 | 16.984 |
| 44328.583333333336 | 16.971 |
| 44328.59375 | 17.007 |
| 44328.604166666664 | 17.079 |
| 44328.614583333336 | 16.993 |
| 44328.625 | 16.873 |
| 44328.635416666664 | 16.796 |
| 44328.645833333336 | 16.743 |
| 44328.65625 | 16.643 |
| 44328.666666666664 | 16.469 |
| 44328.677083333336 | 16.534 |
| 44328.6875 | 16.556 |
| 44328.697916666664 | 16.373 |
| 44328.708333333336 | 16.428 |
| 44328.71875 | 16.541 |
| 44328.729166666664 | 16.644 |
| 44328.739583333336 | 16.801 |
| 44328.75 | 16.869 |
| 44328.760416666664 | 16.934 |
| 44328.770833333336 | 16.958 |
| 44328.78125 | 16.98 |
| 44328.791666666664 | 16.999 |
| 44328.802083333336 | 17.003 |
| 44328.8125 | 16.988 |
| 44328.822916666664 | 16.971 |
| 44328.833333333336 | 16.975 |
| 44328.84375 | 16.978 |
| 44328.854166666664 | 16.969 |
| 44328.864583333336 | 16.994 |
| 44328.875 | 16.983 |
| 44328.885416666664 | 16.957 |
| 44328.895833333336 | 16.868 |
| 44328.90625 | 16.75 |
| 44328.916666666664 | 16.67 |
| 44328.927083333336 | 16.64 |
| 44328.9375 | 16.644 |
| 44328.947916666664 | 16.64 |
| 44328.958333333336 | 16.619 |
| 44328.96875 | 16.637 |
| 44328.979166666664 | 16.654 |
| 44328.989583333336 | 16.656 |
| 44329.0 | 16.657 |
| 44329.010416666664 | 16.656 |
| 44329.020833333336 | 16.65 |
| 44329.03125 | 16.638 |
| 44329.041666666664 | 16.609 |
| 44329.052083333336 | 16.581 |
| 44329.0625 | 16.556 |
| 44329.072916666664 | 16.533 |
| 44329.083333333336 | 16.495 |
| 44329.09375 | 16.478 |
| 44329.104166666664 | 16.445 |
| 44329.114583333336 | 16.497 |
| 44329.125 | 16.377 |
| 44329.135416666664 | 16.367 |
| 44329.145833333336 | 16.259 |
| 44329.15625 | 16.052 |
| 44329.166666666664 | 15.826 |
| 44329.177083333336 | 15.928 |
| 44329.1875 | 15.877 |
| 44329.197916666664 | 15.598 |
| 44329.208333333336 | 15.389 |
| 44329.21875 | 15.347 |
| 44329.229166666664 | 15.285 |
| 44329.239583333336 | 15.191 |
| 44329.25 | 15.266 |
| 44329.260416666664 | 15.225 |
| 44329.270833333336 | 15.278 |
| 44329.28125 | 15.284 |
| 44329.291666666664 | 15.318 |
| 44329.302083333336 | 15.325 |
| 44329.3125 | 15.293 |
| 44329.322916666664 | 15.278 |
| 44329.333333333336 | 15.279 |
| 44329.34375 | 15.291 |
| 44329.354166666664 | 15.302 |
| 44329.364583333336 | 15.291 |
| 44329.375 | 15.214 |
| 44329.385416666664 | 15.232 |
| 44329.395833333336 | 15.248 |
| 44329.40625 | 15.24 |
| 44329.416666666664 | 15.218 |
| 44329.427083333336 | 15.12 |
| 44329.4375 | 15.047 |
| 44329.447916666664 | 15.003 |
| 44329.458333333336 | 14.981 |
| 44329.46875 | 14.976 |
| 44329.479166666664 | 14.943 |
| 44329.489583333336 | 14.913 |
| 44329.5 | 14.91 |
| 44329.510416666664 | 14.924 |
| 44329.520833333336 | 14.942 |
| 44329.53125 | 14.964 |
| 44329.541666666664 | 14.982 |
| 44329.552083333336 | 15.022 |
| 44329.5625 | 15.087 |
| 44329.572916666664 | 15.192 |
| 44329.583333333336 | 15.282 |
| 44329.59375 | 15.391 |
| 44329.604166666664 | 15.606 |
| 44329.614583333336 | 15.75 |
| 44329.625 | 15.821 |
| 44329.635416666664 | 16.226 |
| 44329.645833333336 | 16.129 |
| 44329.65625 | 16.308 |
| 44329.666666666664 | 16.46 |
| 44329.677083333336 | 16.538 |
| 44329.6875 | 16.999 |
| 44329.697916666664 | 17.298 |
| 44329.708333333336 | 17.266 |
| 44329.71875 | 17.602 |
| 44329.729166666664 | 17.99 |
| 44329.739583333336 | 18.279 |
| 44329.75 | 18.696 |
| 44329.760416666664 | 18.904 |
| 44329.770833333336 | 19.153 |
| 44329.78125 | 19.402 |
| 44329.791666666664 | 19.249 |
| 44329.802083333336 | 19.391 |
| 44329.8125 | 19.361 |
| 44329.822916666664 | 19.321 |
| 44329.833333333336 | 19.349 |
| 44329.84375 | 19.388 |
| 44329.854166666664 | 19.373 |
| 44329.864583333336 | 19.392 |
| 44329.875 | 19.265 |
| 44329.885416666664 | 19.022 |
| 44329.895833333336 | 18.95 |
| 44329.90625 | 18.895 |
| 44329.916666666664 | 18.852 |
| 44329.927083333336 | 18.777 |
| 44329.9375 | 18.714 |
| 44329.947916666664 | 18.657 |
| 44329.958333333336 | 18.651 |
| 44329.96875 | 18.638 |
| 44329.979166666664 | 18.598 |
| 44329.989583333336 | 18.548 |
| 44330.0 | 18.495 |
| 44330.010416666664 | 18.465 |
| 44330.020833333336 | 18.454 |
| 44330.03125 | 18.442 |
| 44330.041666666664 | 18.37 |
| 44330.052083333336 | 18.327 |
| 44330.0625 | 18.28 |
| 44330.072916666664 | 18.19 |
| 44330.083333333336 | 18.106 |
| 44330.09375 | 18.035 |
| 44330.104166666664 | 17.971 |
| 44330.114583333336 | 17.914 |
| 44330.125 | 17.845 |
| 44330.135416666664 | 17.99 |
| 44330.145833333336 | 17.908 |
| 44330.15625 | 17.786 |
| 44330.166666666664 | 17.776 |
| 44330.177083333336 | 17.711 |
| 44330.1875 | 17.627 |
| 44330.197916666664 | 17.426 |
| 44330.208333333336 | 17.397 |
| 44330.21875 | 17.233 |
| 44330.229166666664 | 17.188 |
| 44330.239583333336 | 17.076 |
| 44330.25 | 17.024 |
| 44330.260416666664 | 17.25 |
| 44330.270833333336 | 17.214 |
| 44330.28125 | 17.137 |
| 44330.291666666664 | 17.145 |
| 44330.302083333336 | 17.083 |
| 44330.3125 | 17.061 |
| 44330.322916666664 | 17.219 |
| 44330.333333333336 | 17.272 |
| 44330.34375 | 17.164 |
| 44330.354166666664 | 17.249 |
| 44330.364583333336 | 17.145 |
| 44330.375 | 17.227 |
| 44330.385416666664 | 17.214 |
| 44330.395833333336 | 17.118 |
| 44330.40625 | 17.08 |
| 44330.416666666664 | 17.102 |
| 44330.427083333336 | 17.095 |
| 44330.4375 | 17.082 |
| 44330.447916666664 | 17.053 |
| 44330.458333333336 | 17.003 |
| 44330.46875 | 16.949 |
| 44330.479166666664 | 16.864 |
| 44330.489583333336 | 16.795 |
| 44330.5 | 16.76 |
| 44330.510416666664 | 16.737 |
| 44330.520833333336 | 16.726 |
| 44330.53125 | 16.726 |
| 44330.541666666664 | 16.735 |
| 44330.552083333336 | 16.734 |
| 44330.5625 | 16.761 |
| 44330.572916666664 | 16.803 |
| 44330.583333333336 | 16.845 |
| 44330.59375 | 16.884 |
| 44330.604166666664 | 16.952 |
| 44330.614583333336 | 17.008 |
| 44330.625 | 17.094 |
| 44330.635416666664 | 17.383 |
| 44330.645833333336 | 17.649 |
| 44330.65625 | 17.696 |
| 44330.666666666664 | 18.144 |
| 44330.677083333336 | 18.41 |
| 44330.6875 | 18.624 |
| 44330.697916666664 | 18.916 |
| 44330.708333333336 | 18.057 |
| 44330.71875 | 18.451 |
| 44330.729166666664 | 18.717 |
| 44330.739583333336 | 18.813 |
| 44330.75 | 19.146 |
| 44330.760416666664 | 19.299 |
| 44330.770833333336 | 19.52 |
| 44330.78125 | 19.681 |
| 44330.791666666664 | 19.75 |
| 44330.802083333336 | 19.789 |
| 44330.8125 | 19.918 |
| 44330.822916666664 | 19.791 |
| 44330.833333333336 | 19.801 |
| 44330.84375 | 19.738 |
| 44330.854166666664 | 19.736 |
| 44330.864583333336 | 19.747 |
| 44330.875 | 19.775 |
| 44330.885416666664 | 19.785 |
| 44330.895833333336 | 19.789 |
| 44330.90625 | 19.792 |
| 44330.916666666664 | 19.757 |
| 44330.927083333336 | 19.681 |
| 44330.9375 | 19.596 |
| 44330.947916666664 | 19.546 |
| 44330.958333333336 | 19.471 |
| 44330.96875 | 19.386 |
| 44330.979166666664 | 19.285 |
| 44330.989583333336 | 19.182 |
| 44331.0 | 19.089 |
| 44331.010416666664 | 19 |
| 44331.020833333336 | 18.903 |
| 44331.03125 | 18.824 |
| 44331.041666666664 | 18.772 |
| 44331.052083333336 | 18.734 |
| 44331.0625 | 18.695 |
| 44331.072916666664 | 18.681 |
| 44331.083333333336 | 18.652 |
| 44331.09375 | 18.61 |
| 44331.104166666664 | 18.578 |
| 44331.114583333336 | 18.51 |
| 44331.125 | 18.448 |
| 44331.135416666664 | 18.405 |
| 44331.145833333336 | 18.392 |
| 44331.15625 | 18.399 |
| 44331.166666666664 | 18.503 |
| 44331.177083333336 | 18.365 |
| 44331.1875 | 18.263 |
| 44331.197916666664 | 18.155 |
| 44331.208333333336 | 17.992 |
| 44331.21875 | 17.882 |
| 44331.229166666664 | 17.777 |
| 44331.239583333336 | 17.776 |
| 44331.25 | 17.538 |
| 44331.260416666664 | 17.478 |
| 44331.270833333336 | 17.612 |
| 44331.28125 | 17.624 |
| 44331.291666666664 | 17.654 |
| 44331.302083333336 | 17.636 |
| 44331.3125 | 17.67 |
| 44331.322916666664 | 17.74 |
| 44331.333333333336 | 17.72 |
| 44331.34375 | 17.68 |
| 44331.354166666664 | 17.621 |
| 44331.364583333336 | 17.678 |
| 44331.375 | 17.6 |
| 44331.385416666664 | 17.641 |
| 44331.395833333336 | 17.642 |
| 44331.40625 | 17.644 |
| 44331.416666666664 | 17.665 |
| 44331.427083333336 | 17.549 |
| 44331.4375 | 17.546 |
| 44331.447916666664 | 17.57 |
| 44331.458333333336 | 17.574 |
| 44331.46875 | 17.562 |
| 44331.479166666664 | 17.543 |
| 44331.489583333336 | 17.492 |
| 44331.5 | 17.449 |
| 44331.510416666664 | 17.409 |
| 44331.520833333336 | 17.389 |
| 44331.53125 | 17.388 |
| 44331.541666666664 | 17.406 |
| 44331.552083333336 | 17.419 |
| 44331.5625 | 17.443 |
| 44331.572916666664 | 17.497 |
| 44331.583333333336 | 17.556 |
| 44331.59375 | 17.663 |
| 44331.604166666664 | 17.748 |
| 44331.614583333336 | 17.849 |
| 44331.625 | 17.947 |
| 44331.635416666664 | 18.055 |
| 44331.645833333336 | 18.164 |
| 44331.65625 | 18.316 |
| 44331.666666666664 | 18.229 |
| 44331.677083333336 | 18.518 |
| 44331.6875 | 19.066 |
| 44331.697916666664 | 19.824 |
| 44331.708333333336 | 20.062 |
| 44331.71875 | 20.358 |
| 44331.729166666664 | 20.936 |
| 44331.739583333336 | 21.284 |
| 44331.75 | 20.855 |
| 44331.760416666664 | 21.068 |
| 44331.770833333336 | 20.974 |
| 44331.78125 | 20.84 |
| 44331.791666666664 | 21.094 |
| 44331.802083333336 | 21.414 |
| 44331.8125 | 21.692 |
| 44331.822916666664 | 21.858 |
| 44331.833333333336 | 21.992 |
| 44331.84375 | 22.168 |
| 44331.854166666664 | 22.252 |
| 44331.864583333336 | 22.261 |
| 44331.875 | 22.337 |
| 44331.885416666664 | 22.337 |
| 44331.895833333336 | 22.289 |
| 44331.90625 | 22.206 |
| 44331.916666666664 | 22.163 |
| 44331.927083333336 | 22.073 |
| 44331.9375 | 21.922 |
| 44331.947916666664 | 21.766 |
| 44331.958333333336 | 21.66 |
| 44331.96875 | 21.461 |
| 44331.979166666664 | 21.173 |
| 44331.989583333336 | 20.93 |
| 44332.0 | 20.716 |
| 44332.010416666664 | 20.534 |
| 44332.020833333336 | 20.384 |
| 44332.03125 | 20.254 |
| 44332.041666666664 | 20.143 |
| 44332.052083333336 | 20.034 |
| 44332.0625 | 19.946 |
| 44332.072916666664 | 19.879 |
| 44332.083333333336 | 19.847 |
| 44332.09375 | 19.828 |
| 44332.104166666664 | 19.802 |
| 44332.114583333336 | 19.768 |
| 44332.125 | 19.741 |
| 44332.135416666664 | 19.716 |
| 44332.145833333336 | 19.687 |
| 44332.15625 | 19.625 |
| 44332.166666666664 | 19.589 |
| 44332.177083333336 | 19.554 |
| 44332.1875 | 19.58 |
| 44332.197916666664 | 19.567 |
| 44332.208333333336 | 19.413 |
| 44332.21875 | 19.241 |
| 44332.229166666664 | 19.26 |
| 44332.239583333336 | 18.912 |
| 44332.25 | 18.843 |
| 44332.260416666664 | 18.693 |
| 44332.270833333336 | 18.706 |
| 44332.28125 | 18.504 |
| 44332.291666666664 | 18.526 |
| 44332.302083333336 | 18.787 |
| 44332.3125 | 18.749 |
| 44332.322916666664 | 18.82 |
| 44332.333333333336 | 18.782 |
| 44332.34375 | 18.814 |
| 44332.354166666664 | 18.892 |
| 44332.364583333336 | 18.943 |
| 44332.375 | 18.958 |
| 44332.385416666664 | 18.976 |
| 44332.395833333336 | 18.966 |
| 44332.40625 | 18.979 |
| 44332.416666666664 | 18.967 |
| 44332.427083333336 | 18.924 |
| 44332.4375 | 18.989 |
| 44332.447916666664 | 18.974 |
| 44332.458333333336 | 18.881 |
| 44332.46875 | 18.849 |
| 44332.479166666664 | 18.857 |
| 44332.489583333336 | 18.877 |
| 44332.5 | 18.864 |
| 44332.510416666664 | 18.851 |
| 44332.520833333336 | 18.809 |
| 44332.53125 | 18.746 |
| 44332.541666666664 | 18.685 |
| 44332.552083333336 | 18.68 |
| 44332.5625 | 18.714 |
| 44332.572916666664 | 18.728 |
| 44332.583333333336 | 18.743 |
| 44332.59375 | 18.769 |
| 44332.604166666664 | 18.788 |
| 44332.614583333336 | 18.844 |
| 44332.625 | 18.884 |
| 44332.635416666664 | 18.941 |
| 44332.645833333336 | 19.01 |
| 44332.65625 | 19.076 |
| 44332.666666666664 | 19.137 |
| 44332.677083333336 | 19.175 |
| 44332.6875 | 19.366 |
| 44332.697916666664 | 19.507 |
| 44332.708333333336 | 19.774 |
| 44332.71875 | 19.915 |
| 44332.729166666664 | 20.337 |
| 44332.739583333336 | 20.91 |
| 44332.75 | 21.218 |
| 44332.760416666664 | 20.939 |
| 44332.770833333336 | 20.817 |
| 44332.78125 | 21.113 |
| 44332.791666666664 | 20.926 |
| 44332.802083333336 | 21.398 |
| 44332.8125 | 21.568 |
| 44332.822916666664 | 21.643 |
| 44332.833333333336 | 21.855 |
| 44332.84375 | 21.969 |
| 44332.854166666664 | 22.029 |
| 44332.864583333336 | 22.301 |
| 44332.875 | 22.178 |
| 44332.885416666664 | 22.075 |
| 44332.895833333336 | 21.971 |
| 44332.90625 | 21.989 |
| 44332.916666666664 | 22.003 |
| 44332.927083333336 | 22.028 |
| 44332.9375 | 22.006 |
| 44332.947916666664 | 21.95 |
| 44332.958333333336 | 21.856 |
| 44332.96875 | 21.811 |
| 44332.979166666664 | 21.772 |
| 44332.989583333336 | 21.67 |
| 44333.0 | 21.578 |
| 44333.010416666664 | 21.38 |
| 44333.020833333336 | 21.127 |
| 44333.03125 | 20.857 |
| 44333.041666666664 | 20.605 |
| 44333.052083333336 | 20.416 |
| 44333.0625 | 20.248 |
| 44333.072916666664 | 20.131 |
| 44333.083333333336 | 19.975 |
| 44333.09375 | 19.869 |
| 44333.104166666664 | 19.783 |
| 44333.114583333336 | 19.71 |
| 44333.125 | 19.659 |
| 44333.135416666664 | 19.604 |
| 44333.145833333336 | 19.557 |
| 44333.15625 | 19.509 |
| 44333.166666666664 | 19.483 |
| 44333.177083333336 | 19.462 |
| 44333.1875 | 19.451 |
| 44333.197916666664 | 19.436 |
| 44333.208333333336 | 19.485 |
| 44333.21875 | 19.544 |
| 44333.229166666664 | 19.454 |
| 44333.239583333336 | 19.386 |
| 44333.25 | 19.243 |
| 44333.260416666664 | 19.206 |
| 44333.270833333336 | 18.954 |
| 44333.28125 | 18.89 |
| 44333.291666666664 | 19.012 |
| 44333.302083333336 | 18.869 |
| 44333.3125 | 18.868 |
| 44333.322916666664 | 18.748 |
| 44333.333333333336 | 18.751 |
| 44333.34375 | 18.857 |
| 44333.354166666664 | 18.909 |
| 44333.364583333336 | 19.013 |
| 44333.375 | 19.05 |
| 44333.385416666664 | 19.108 |
| 44333.395833333336 | 19.136 |
| 44333.40625 | 19.166 |
| 44333.416666666664 | 19.193 |
| 44333.427083333336 | 19.159 |
| 44333.4375 | 19.193 |
| 44333.447916666664 | 19.2 |
| 44333.458333333336 | 19.2 |
| 44333.46875 | 19.202 |
| 44333.479166666664 | 19.2 |
| 44333.489583333336 | 19.146 |
| 44333.5 | 19.114 |
| 44333.510416666664 | 19.145 |
| 44333.520833333336 | 19.163 |
| 44333.53125 | 19.162 |
| 44333.541666666664 | 19.144 |
| 44333.552083333336 | 19.1 |
| 44333.5625 | 19.063 |
| 44333.572916666664 | 19.046 |
| 44333.583333333336 | 19.057 |
| 44333.59375 | 19.059 |
| 44333.604166666664 | 19.095 |
| 44333.614583333336 | 19.156 |
| 44333.625 | 19.209 |
| 44333.635416666664 | 19.247 |
| 44333.645833333336 | 19.326 |
| 44333.65625 | 19.418 |
| 44333.666666666664 | 19.515 |
| 44333.677083333336 | 19.614 |
| 44333.6875 | 19.735 |
| 44333.697916666664 | 19.843 |
| 44333.708333333336 | 19.854 |
| 44333.71875 | 19.815 |
| 44333.729166666664 | 20.362 |
| 44333.739583333336 | 21.029 |
| 44333.75 | 21.424 |
| 44333.760416666664 | 21.812 |
| 44333.770833333336 | 22.284 |
| 44333.78125 | 22.432 |
| 44333.791666666664 | 22.402 |
| 44333.802083333336 | 23.048 |
| 44333.8125 | 22.941 |
| 44333.822916666664 | 22.404 |
| 44333.833333333336 | 22.485 |
| 44333.84375 | 22.65 |
| 44333.854166666664 | 22.835 |
| 44333.864583333336 | 23.179 |
| 44333.875 | 23.466 |
| 44333.885416666664 | 23.597 |
| 44333.895833333336 | 23.5 |
| 44333.90625 | 23.525 |
| 44333.916666666664 | 23.572 |
| 44333.927083333336 | 23.553 |
| 44333.9375 | 23.557 |
| 44333.947916666664 | 23.527 |
| 44333.958333333336 | 23.536 |
| 44333.96875 | 23.527 |
| 44333.979166666664 | 23.428 |
| 44333.989583333336 | 23.326 |
| 44334.0 | 23.263 |
| 44334.010416666664 | 23.225 |
| 44334.020833333336 | 23.134 |
| 44334.03125 | 22.984 |
| 44334.041666666664 | 22.733 |
| 44334.052083333336 | 22.457 |
| 44334.0625 | 22.182 |
| 44334.072916666664 | 21.904 |
| 44334.083333333336 | 21.594 |
| 44334.09375 | 21.416 |
| 44334.104166666664 | 21.239 |
| 44334.114583333336 | 21.101 |
| 44334.125 | 20.968 |
| 44334.135416666664 | 20.858 |
| 44334.145833333336 | 20.778 |
| 44334.15625 | 20.692 |
| 44334.166666666664 | 20.629 |
| 44334.177083333336 | 20.563 |
| 44334.1875 | 20.518 |
| 44334.197916666664 | 20.47 |
| 44334.208333333336 | 20.436 |
| 44334.21875 | 20.432 |
| 44334.229166666664 | 20.426 |
| 44334.239583333336 | 20.525 |
| 44334.25 | 20.574 |
| 44334.260416666664 | 20.445 |
| 44334.270833333336 | 20.37 |
| 44334.28125 | 20.204 |
| 44334.291666666664 | 20.049 |
| 44334.302083333336 | 20.013 |
| 44334.3125 | 19.783 |
| 44334.322916666664 | 19.71 |
| 44334.333333333336 | 19.694 |
| 44334.34375 | 19.61 |
| 44334.354166666664 | 19.791 |
| 44334.364583333336 | 19.681 |
| 44334.375 | 19.82 |
| 44334.385416666664 | 19.882 |
| 44334.395833333336 | 19.959 |
| 44334.40625 | 20.038 |
| 44334.416666666664 | 20.065 |
| 44334.427083333336 | 20.089 |
| 44334.4375 | 20.11 |
| 44334.447916666664 | 20.117 |
| 44334.458333333336 | 20.096 |
| 44334.46875 | 20.117 |
| 44334.479166666664 | 20.159 |
| 44334.489583333336 | 20.188 |
| 44334.5 | 20.267 |
| 44334.510416666664 | 20.309 |
| 44334.520833333336 | 20.351 |
| 44334.53125 | 20.257 |
| 44334.541666666664 | 20.247 |
| 44334.552083333336 | 20.212 |
| 44334.5625 | 20.233 |
| 44334.572916666664 | 20.237 |
| 44334.583333333336 | 20.218 |
| 44334.59375 | 20.198 |
| 44334.604166666664 | 20.199 |
| 44334.614583333336 | 20.265 |
| 44334.625 | 20.334 |
| 44334.635416666664 | 20.442 |
| 44334.645833333336 | 20.53 |
| 44334.65625 | 20.655 |
| 44334.666666666664 | 20.748 |
| 44334.677083333336 | 20.824 |
| 44334.6875 | 20.915 |
| 44334.697916666664 | 21.069 |
| 44334.708333333336 | 21.201 |
| 44334.71875 | 21.34 |
| 44334.729166666664 | 21.446 |
| 44334.739583333336 | 21.543 |
| 44334.75 | 21.775 |
| 44334.760416666664 | 21.958 |
| 44334.770833333336 | 22.233 |
| 44334.78125 | 23.103 |
| 44334.791666666664 | 23.482 |
| 44334.802083333336 | 23.743 |
| 44334.8125 | 23.886 |
| 44334.822916666664 | 23.977 |
| 44334.833333333336 | 23.528 |
| 44334.84375 | 24.052 |
| 44334.854166666664 | 24.129 |
| 44334.864583333336 | 24.069 |
| 44334.875 | 23.986 |
| 44334.885416666664 | 23.988 |
| 44334.895833333336 | 24.036 |
| 44334.90625 | 24.268 |
| 44334.916666666664 | 24.316 |
| 44334.927083333336 | 24.452 |
| 44334.9375 | 24.519 |
| 44334.947916666664 | 24.506 |
| 44334.958333333336 | 24.437 |
| 44334.96875 | 24.387 |
| 44334.979166666664 | 24.35 |
| 44334.989583333336 | 24.335 |
| 44335.0 | 24.303 |
| 44335.010416666664 | 24.212 |
| 44335.020833333336 | 24.152 |
| 44335.03125 | 24.088 |
| 44335.041666666664 | 24.046 |
| 44335.052083333336 | 23.939 |
| 44335.0625 | 23.699 |
| 44335.072916666664 | 23.391 |
| 44335.083333333336 | 23.024 |
| 44335.09375 | 22.731 |
| 44335.104166666664 | 22.41 |
| 44335.114583333336 | 22.145 |
| 44335.125 | 21.857 |
| 44335.135416666664 | 21.702 |
| 44335.145833333336 | 21.59 |
| 44335.15625 | 21.482 |
| 44335.166666666664 | 21.343 |
| 44335.177083333336 | 21.23 |
| 44335.1875 | 21.14 |
| 44335.197916666664 | 21.07 |
| 44335.208333333336 | 21.023 |
| 44335.21875 | 20.971 |
| 44335.229166666664 | 20.924 |
| 44335.239583333336 | 20.895 |
| 44335.25 | 20.852 |
| 44335.260416666664 | 20.787 |
| 44335.270833333336 | 20.836 |
| 44335.28125 | 20.946 |
| 44335.291666666664 | 20.922 |
| 44335.302083333336 | 20.803 |
| 44335.3125 | 20.699 |
| 44335.322916666664 | 20.551 |
| 44335.333333333336 | 20.315 |
| 44335.34375 | 20.05 |
| 44335.354166666664 | 20.255 |
| 44335.364583333336 | 20.183 |
| 44335.375 | 19.998 |
| 44335.385416666664 | 20.121 |
| 44335.395833333336 | 20.242 |
| 44335.40625 | 20.159 |
| 44335.416666666664 | 20.263 |
| 44335.427083333336 | 20.308 |
| 44335.4375 | 20.461 |
| 44335.447916666664 | 20.554 |
| 44335.458333333336 | 20.578 |
| 44335.46875 | 20.653 |
| 44335.479166666664 | 20.666 |
| 44335.489583333336 | 20.647 |
| 44335.5 | 20.696 |
| 44335.510416666664 | 20.751 |
| 44335.520833333336 | 20.781 |
| 44335.53125 | 20.83 |
| 44335.541666666664 | 20.874 |
| 44335.552083333336 | 20.883 |
| 44335.5625 | 20.959 |
| 44335.572916666664 | 20.988 |
| 44335.583333333336 | 21.004 |
| 44335.59375 | 21.033 |
| 44335.604166666664 | 21.067 |
| 44335.614583333336 | 20.988 |
| 44335.625 | 20.947 |
| 44335.635416666664 | 20.918 |
| 44335.645833333336 | 21.001 |
| 44335.65625 | 21.143 |
| 44335.666666666664 | 21.239 |
| 44335.677083333336 | 21.413 |
| 44335.6875 | 21.537 |
| 44335.697916666664 | 21.733 |
| 44335.708333333336 | 21.896 |
| 44335.71875 | 22.003 |
| 44335.729166666664 | 22.194 |
| 44335.739583333336 | 22.343 |
| 44335.75 | 22.451 |
| 44335.760416666664 | 22.669 |
| 44335.770833333336 | 22.695 |
| 44335.78125 | 22.715 |
| 44335.791666666664 | 22.709 |
| 44335.802083333336 | 22.761 |
| 44335.8125 | 23.212 |
| 44335.822916666664 | 23.444 |
| 44335.833333333336 | 23.411 |
| 44335.84375 | 24.059 |
| 44335.854166666664 | 24.106 |
| 44335.864583333336 | 24.266 |
| 44335.875 | 24.175 |
| 44335.885416666664 | 24.081 |
| 44335.895833333336 | 23.85 |
| 44335.90625 | 23.964 |
| 44335.916666666664 | 23.926 |
| 44335.927083333336 | 24.046 |
| 44335.9375 | 24.116 |
| 44335.947916666664 | 24.295 |
| 44335.958333333336 | 24.569 |
| 44335.96875 | 24.836 |
| 44335.979166666664 | 24.937 |
| 44335.989583333336 | 25.039 |
| 44336.0 | 25.145 |
| 44336.010416666664 | 25.17 |
| 44336.020833333336 | 25.176 |
| 44336.03125 | 25.246 |
| 44336.041666666664 | 25.223 |
| 44336.052083333336 | 25.181 |
| 44336.0625 | 24.99 |
| 44336.072916666664 | 24.88 |
| 44336.083333333336 | 24.797 |
| 44336.09375 | 24.601 |
| 44336.104166666664 | 24.429 |
| 44336.114583333336 | 24.092 |
| 44336.125 | 23.732 |
| 44336.135416666664 | 23.539 |
| 44336.145833333336 | 23.323 |
| 44336.15625 | 23.085 |
| 44336.166666666664 | 22.839 |
| 44336.177083333336 | 22.678 |
| 44336.1875 | 22.506 |
| 44336.197916666664 | 22.392 |
| 44336.208333333336 | 22.302 |
| 44336.21875 | 22.227 |
| 44336.229166666664 | 22.133 |
| 44336.239583333336 | 22.011 |
| 44336.25 | 21.918 |
| 44336.260416666664 | 21.854 |
| 44336.270833333336 | 21.848 |
| 44336.28125 | 21.862 |
| 44336.291666666664 | 21.871 |
| 44336.302083333336 | 21.902 |
| 44336.3125 | 21.921 |
| 44336.322916666664 | 21.98 |
| 44336.333333333336 | 21.893 |
| 44336.34375 | 21.859 |
| 44336.354166666664 | 21.789 |
| 44336.364583333336 | 21.708 |
| 44336.375 | 21.512 |
| 44336.385416666664 | 21.32 |
| 44336.395833333336 | 21.213 |
| 44336.40625 | 21.115 |
| 44336.416666666664 | 21.058 |
| 44336.427083333336 | 21.051 |
| 44336.4375 | 21.164 |
| 44336.447916666664 | 21.289 |
| 44336.458333333336 | 21.242 |
| 44336.46875 | 21.457 |
| 44336.479166666664 | 21.553 |
| 44336.489583333336 | 21.705 |
| 44336.5 | 21.794 |
| 44336.510416666664 | 21.878 |
| 44336.520833333336 | 21.935 |
| 44336.53125 | 22.001 |
| 44336.541666666664 | 22.088 |
| 44336.552083333336 | 22.186 |
| 44336.5625 | 22.243 |
| 44336.572916666664 | 22.312 |
| 44336.583333333336 | 22.452 |
| 44336.59375 | 22.427 |
| 44336.604166666664 | 22.459 |
| 44336.614583333336 | 22.474 |
| 44336.625 | 22.44 |
| 44336.635416666664 | 22.511 |
| 44336.645833333336 | 22.483 |
| 44336.65625 | 22.433 |
| 44336.666666666664 | 22.403 |
| 44336.677083333336 | 22.429 |
| 44336.6875 | 22.568 |
| 44336.697916666664 | 22.755 |
| 44336.708333333336 | 22.876 |
| 44336.71875 | 22.952 |
| 44336.729166666664 | 23.022 |
| 44336.739583333336 | 23.102 |
| 44336.75 | 23.219 |
| 44336.760416666664 | 23.332 |
| 44336.770833333336 | 23.425 |
| 44336.78125 | 23.478 |
| 44336.791666666664 | 23.523 |
| 44336.802083333336 | 23.56 |
| 44336.8125 | 23.584 |
| 44336.822916666664 | 23.613 |
| 44336.833333333336 | 23.673 |
| 44336.84375 | 23.727 |
| 44336.854166666664 | 23.764 |
| 44336.864583333336 | 24.067 |
| 44336.875 | 24.157 |
| 44336.885416666664 | 24.306 |
| 44336.895833333336 | 24.361 |
| 44336.90625 | 24.507 |
| 44336.916666666664 | 24.498 |
| 44336.927083333336 | 24.436 |
| 44336.9375 | 24.41 |
| 44336.947916666664 | 24.433 |
| 44336.958333333336 | 24.551 |
| 44336.96875 | 24.434 |
| 44336.979166666664 | 24.534 |
| 44336.989583333336 | 24.49 |
| 44337.0 | 24.401 |
| 44337.010416666664 | 24.293 |
| 44337.020833333336 | 24.216 |
| 44337.03125 | 24.105 |
| 44337.041666666664 | 24.055 |
| 44337.052083333336 | 23.981 |
| 44337.0625 | 23.957 |
| 44337.072916666664 | 23.941 |
| 44337.083333333336 | 23.896 |
| 44337.09375 | 23.818 |
| 44337.104166666664 | 23.79 |
| 44337.114583333336 | 23.668 |
| 44337.125 | 23.696 |
| 44337.135416666664 | 23.67 |
| 44337.145833333336 | 23.632 |
| 44337.15625 | 23.578 |
| 44337.166666666664 | 23.481 |
| 44337.177083333336 | 23.363 |
| 44337.1875 | 23.249 |
| 44337.197916666664 | 22.909 |
| 44337.208333333336 | 22.624 |
| 44337.21875 | 22.464 |
| 44337.229166666664 | 22.315 |
| 44337.239583333336 | 22.155 |
| 44337.25 | 21.882 |
| 44337.260416666664 | 21.741 |
| 44337.270833333336 | 21.617 |
| 44337.28125 | 21.545 |
| 44337.291666666664 | 21.46 |
| 44337.302083333336 | 21.325 |
| 44337.3125 | 21.272 |
| 44337.322916666664 | 21.147 |
| 44337.333333333336 | 21.064 |
| 44337.34375 | 21.105 |
| 44337.354166666664 | 21.027 |
| 44337.364583333336 | 21.314 |
| 44337.375 | 21.116 |
| 44337.385416666664 | 21.003 |
| 44337.395833333336 | 20.946 |
| 44337.40625 | 20.829 |
| 44337.416666666664 | 20.718 |
| 44337.427083333336 | 20.631 |
| 44337.4375 | 20.391 |
| 44337.447916666664 | 20.243 |
| 44337.458333333336 | 20.319 |
| 44337.46875 | 20.055 |
| 44337.479166666664 | 20.139 |
| 44337.489583333336 | 20.133 |
| 44337.5 | 20.051 |
| 44337.510416666664 | 20.028 |
| 44337.520833333336 | 20.068 |
| 44337.53125 | 20.202 |
| 44337.541666666664 | 20.296 |
| 44337.552083333336 | 20.372 |
| 44337.5625 | 20.455 |
| 44337.572916666664 | 20.579 |
| 44337.583333333336 | 20.703 |
| 44337.59375 | 20.791 |
| 44337.604166666664 | 20.87 |
| 44337.614583333336 | 21.043 |
| 44337.625 | 21.069 |
| 44337.635416666664 | 21.169 |
| 44337.645833333336 | 21.303 |
| 44337.65625 | 21.251 |
| 44337.666666666664 | 21.185 |
| 44337.677083333336 | 21.29 |
| 44337.6875 | 21.297 |
| 44337.697916666664 | 21.319 |
| 44337.708333333336 | 21.43 |
| 44337.71875 | 21.665 |
| 44337.729166666664 | 21.91 |
| 44337.739583333336 | 22.153 |
| 44337.75 | 22.246 |
| 44337.760416666664 | 22.339 |
| 44337.770833333336 | 22.492 |
| 44337.78125 | 22.604 |
| 44337.791666666664 | 22.761 |
| 44337.802083333336 | 22.892 |
| 44337.8125 | 23.013 |
| 44337.822916666664 | 23.102 |
| 44337.833333333336 | 23.159 |
| 44337.84375 | 23.179 |
| 44337.854166666664 | 23.229 |
| 44337.864583333336 | 23.216 |
| 44337.875 | 23.224 |
| 44337.885416666664 | 23.338 |
| 44337.895833333336 | 23.535 |
| 44337.90625 | 23.589 |
| 44337.916666666664 | 23.887 |
| 44337.927083333336 | 23.799 |
| 44337.9375 | 23.765 |
| 44337.947916666664 | 23.849 |
| 44337.958333333336 | 23.86 |
| 44337.96875 | 23.98 |
| 44337.979166666664 | 23.935 |
| 44337.989583333336 | 23.971 |
| 44338.0 | 24.091 |
| 44338.010416666664 | 24.277 |
| 44338.020833333336 | 24.196 |
| 44338.03125 | 24.129 |
| 44338.041666666664 | 23.978 |
| 44338.052083333336 | 23.739 |
| 44338.0625 | 23.737 |
| 44338.072916666664 | 23.574 |
| 44338.083333333336 | 23.399 |
| 44338.09375 | 23.416 |
| 44338.104166666664 | 23.317 |
| 44338.114583333336 | 23.286 |
| 44338.125 | 23.299 |
| 44338.135416666664 | 23.245 |
| 44338.145833333336 | 23.218 |
| 44338.15625 | 23.177 |
| 44338.166666666664 | 23.195 |
| 44338.177083333336 | 23.198 |
| 44338.1875 | 23.191 |
| 44338.197916666664 | 23.159 |
| 44338.208333333336 | 23.078 |
| 44338.21875 | 23.03 |
| 44338.229166666664 | 22.938 |
| 44338.239583333336 | 22.813 |
| 44338.25 | 22.698 |
| 44338.260416666664 | 22.568 |
| 44338.270833333336 | 22.468 |
| 44338.28125 | 22.334 |
| 44338.291666666664 | 22.233 |
| 44338.302083333336 | 22.105 |
| 44338.3125 | 22.006 |
| 44338.322916666664 | 21.916 |
| 44338.333333333336 | 21.822 |
| 44338.34375 | 21.717 |
| 44338.354166666664 | 21.623 |
| 44338.364583333336 | 21.546 |
| 44338.375 | 21.486 |
| 44338.385416666664 | 21.459 |
| 44338.395833333336 | 21.431 |
| 44338.40625 | 21.393 |
| 44338.416666666664 | 21.578 |
| 44338.427083333336 | 21.41 |
| 44338.4375 | 21.301 |
| 44338.447916666664 | 21.084 |
| 44338.458333333336 | 21.004 |
| 44338.46875 | 20.948 |
| 44338.479166666664 | 20.761 |
| 44338.489583333336 | 20.772 |
| 44338.5 | 20.736 |
| 44338.510416666664 | 20.725 |
| 44338.520833333336 | 20.892 |
| 44338.53125 | 20.9 |
| 44338.541666666664 | 21.06 |
| 44338.552083333336 | 21.197 |
| 44338.5625 | 21.37 |
| 44338.572916666664 | 21.5 |
| 44338.583333333336 | 21.623 |
| 44338.59375 | 21.74 |
| 44338.604166666664 | 21.865 |
| 44338.614583333336 | 21.975 |
| 44338.625 | 22.058 |
| 44338.635416666664 | 22.167 |
| 44338.645833333336 | 22.22 |
| 44338.65625 | 22.43 |
| 44338.666666666664 | 22.358 |
| 44338.677083333336 | 22.358 |
| 44338.6875 | 22.329 |
| 44338.697916666664 | 22.273 |
| 44338.708333333336 | 22.298 |
| 44338.71875 | 22.396 |
| 44338.729166666664 | 22.509 |
| 44338.739583333336 | 22.578 |
| 44338.75 | 22.727 |
| 44338.760416666664 | 22.994 |
| 44338.770833333336 | 23.262 |
| 44338.78125 | 23.579 |
| 44338.791666666664 | 23.748 |
| 44338.802083333336 | 23.931 |
| 44338.8125 | 24.082 |
| 44338.822916666664 | 24.188 |
| 44338.833333333336 | 24.215 |
| 44338.84375 | 24.129 |
| 44338.854166666664 | 23.986 |
| 44338.864583333336 | 23.832 |
| 44338.875 | 23.704 |
| 44338.885416666664 | 23.592 |
| 44338.895833333336 | 23.521 |
| 44338.90625 | 23.48 |
| 44338.916666666664 | 23.458 |
| 44338.927083333336 | 23.426 |
| 44338.9375 | 23.421 |
| 44338.947916666664 | 23.308 |
| 44338.958333333336 | 23.458 |
| 44338.96875 | 23.564 |
| 44338.979166666664 | 23.846 |
| 44338.989583333336 | 23.896 |
| 44339.0 | 23.908 |
| 44339.010416666664 | 23.899 |
| 44339.020833333336 | 24.036 |
| 44339.03125 | 24.165 |
| 44339.041666666664 | 24.481 |
| 44339.052083333336 | 24.511 |
| 44339.0625 | 24.599 |
| 44339.072916666664 | 24.53 |
| 44339.083333333336 | 24.491 |
| 44339.09375 | 24.316 |
| 44339.104166666664 | 24.12 |
| 44339.114583333336 | 24.087 |
| 44339.125 | 24.02 |
| 44339.135416666664 | 23.972 |
| 44339.145833333336 | 23.908 |
| 44339.15625 | 23.894 |
| 44339.166666666664 | 23.85 |
| 44339.177083333336 | 23.844 |
| 44339.1875 | 23.832 |
| 44339.197916666664 | 23.808 |
| 44339.208333333336 | 23.825 |
| 44339.21875 | 23.816 |
| 44339.229166666664 | 23.83 |
| 44339.239583333336 | 23.825 |
| 44339.25 | 23.761 |
| 44339.260416666664 | 23.733 |
| 44339.270833333336 | 23.676 |
| 44339.28125 | 23.573 |
| 44339.291666666664 | 23.471 |
| 44339.302083333336 | 23.338 |
| 44339.3125 | 23.255 |
| 44339.322916666664 | 23.143 |
| 44339.333333333336 | 23.016 |
| 44339.34375 | 22.918 |
| 44339.354166666664 | 22.829 |
| 44339.364583333336 | 22.732 |
| 44339.375 | 22.606 |
| 44339.385416666664 | 22.467 |
| 44339.395833333336 | 22.359 |
| 44339.40625 | 22.283 |
| 44339.416666666664 | 22.237 |
| 44339.427083333336 | 22.225 |
| 44339.4375 | 22.301 |
| 44339.447916666664 | 22.544 |
| 44339.458333333336 | 22.233 |
| 44339.46875 | 22.323 |
| 44339.479166666664 | 22.301 |
| 44339.489583333336 | 22.296 |
| 44339.5 | 22.284 |
| 44339.510416666664 | 22.376 |
| 44339.520833333336 | 22.244 |
| 44339.53125 | 22.291 |
| 44339.541666666664 | 22.454 |
| 44339.552083333336 | 22.427 |
| 44339.5625 | 22.456 |
| 44339.572916666664 | 22.564 |
| 44339.583333333336 | 22.728 |
| 44339.59375 | 22.836 |
| 44339.604166666664 | 22.924 |
| 44339.614583333336 | 23.034 |
| 44339.625 | 23.136 |
| 44339.635416666664 | 23.278 |
| 44339.645833333336 | 23.407 |
| 44339.65625 | 23.568 |
| 44339.666666666664 | 23.684 |
| 44339.677083333336 | 23.817 |
| 44339.6875 | 23.818 |
| 44339.697916666664 | 24.039 |
| 44339.708333333336 | 24.011 |
| 44339.71875 | 23.848 |
| 44339.729166666664 | 23.905 |
| 44339.739583333336 | 23.869 |
| 44339.75 | 23.907 |
| 44339.760416666664 | 23.879 |
| 44339.770833333336 | 23.856 |
| 44339.78125 | 23.909 |
| 44339.791666666664 | 24.322 |
| 44339.802083333336 | 24.646 |
| 44339.8125 | 24.909 |
| 44339.822916666664 | 25.073 |
| 44339.833333333336 | 25.265 |
| 44339.84375 | 25.348 |
| 44339.854166666664 | 25.352 |
| 44339.864583333336 | 25.152 |
| 44339.875 | 24.865 |
| 44339.885416666664 | 24.665 |
| 44339.895833333336 | 24.527 |
| 44339.90625 | 24.449 |
| 44339.916666666664 | 24.429 |
| 44339.927083333336 | 24.407 |
| 44339.9375 | 24.354 |
| 44339.947916666664 | 24.302 |
| 44339.958333333336 | 24.261 |
| 44339.96875 | 24.229 |
| 44339.979166666664 | 24.208 |
| 44339.989583333336 | 24.235 |
| 44340.0 | 24.357 |
| 44340.010416666664 | 24.485 |
| 44340.020833333336 | 24.51 |
| 44340.03125 | 24.586 |
| 44340.041666666664 | 24.608 |
| 44340.052083333336 | 24.738 |
| 44340.0625 | 25.07 |
| 44340.072916666664 | 25.307 |
| 44340.083333333336 | 25.511 |
| 44340.09375 | 25.554 |
| 44340.104166666664 | 25.531 |
| 44340.114583333336 | 25.491 |
| 44340.125 | 25.44 |
| 44340.135416666664 | 25.412 |
| 44340.145833333336 | 25.263 |
| 44340.15625 | 25.295 |
| 44340.166666666664 | 25.27 |
| 44340.177083333336 | 25.204 |
| 44340.1875 | 25.19 |
| 44340.197916666664 | 25.193 |
| 44340.208333333336 | 25.169 |
| 44340.21875 | 25.071 |
| 44340.229166666664 | 25.123 |
| 44340.239583333336 | 25.062 |
| 44340.25 | 25.044 |
| 44340.260416666664 | 25.074 |
| 44340.270833333336 | 25.063 |
| 44340.28125 | 25.06 |
| 44340.291666666664 | 24.957 |
| 44340.302083333336 | 24.844 |
| 44340.3125 | 24.735 |
| 44340.322916666664 | 24.623 |
| 44340.333333333336 | 24.493 |
| 44340.34375 | 24.309 |
| 44340.354166666664 | 24.156 |
| 44340.364583333336 | 23.983 |
| 44340.375 | 23.849 |
| 44340.385416666664 | 23.63 |
| 44340.395833333336 | 23.467 |
| 44340.40625 | 23.286 |
| 44340.416666666664 | 23.112 |
| 44340.427083333336 | 22.937 |
| 44340.4375 | 22.778 |
| 44340.447916666664 | 22.6 |
| 44340.458333333336 | 22.512 |
| 44340.46875 | 22.933 |
| 44340.479166666664 | 23.102 |
| 44340.489583333336 | 22.384 |
| 44340.5 | 22.66 |
| 44340.510416666664 | 22.415 |
| 44340.520833333336 | 22.439 |
| 44340.53125 | 22.49 |
| 44340.541666666664 | 22.5 |
| 44340.552083333336 | 22.365 |
| 44340.5625 | 22.299 |
| 44340.572916666664 | 22.279 |
| 44340.583333333336 | 22.291 |
| 44340.59375 | 22.157 |
| 44340.604166666664 | 22.199 |
| 44340.614583333336 | 22.058 |
| 44340.625 | 22.072 |
| 44340.635416666664 | 22.055 |
| 44340.645833333336 | 22.158 |
| 44340.65625 | 22.204 |
| 44340.666666666664 | 22.22 |
| 44340.677083333336 | 22.328 |
| 44340.6875 | 22.355 |
| 44340.697916666664 | 22.442 |
| 44340.708333333336 | 22.532 |
| 44340.71875 | 22.575 |
| 44340.729166666664 | 22.57 |
| 44340.739583333336 | 22.575 |
| 44340.75 | 22.538 |
| 44340.760416666664 | 22.433 |
| 44340.770833333336 | 22.474 |
| 44340.78125 | 22.488 |
| 44340.791666666664 | 22.413 |
| 44340.802083333336 | 22.317 |
| 44340.8125 | 22.209 |
| 44340.822916666664 | 22.107 |
| 44340.833333333336 | 21.971 |
| 44340.84375 | 21.83 |
| 44340.854166666664 | 21.67 |
| 44340.864583333336 | 21.513 |
| 44340.875 | 21.388 |
| 44340.885416666664 | 21.341 |
| 44340.895833333336 | 21.336 |
| 44340.90625 | 21.336 |
| 44340.916666666664 | 21.322 |
| 44340.927083333336 | 21.306 |
| 44340.9375 | 21.291 |
| 44340.947916666664 | 21.253 |
| 44340.958333333336 | 21.244 |
| 44340.96875 | 21.226 |
| 44340.979166666664 | 21.212 |
| 44340.989583333336 | 21.193 |
| 44341.0 | 21.172 |
| 44341.010416666664 | 21.15 |
| 44341.020833333336 | 21.137 |
| 44341.03125 | 21.04 |
| 44341.041666666664 | 21.067 |
| 44341.052083333336 | 20.867 |
| 44341.0625 | 20.807 |
| 44341.072916666664 | 20.713 |
| 44341.083333333336 | 20.644 |
| 44341.09375 | 20.446 |
| 44341.104166666664 | 20.374 |
| 44341.114583333336 | 20.136 |
| 44341.125 | 20.034 |
| 44341.135416666664 | 20.131 |
| 44341.145833333336 | 19.994 |
| 44341.15625 | 19.945 |
| 44341.166666666664 | 19.893 |
| 44341.177083333336 | 19.833 |
| 44341.1875 | 19.796 |
| 44341.197916666664 | 19.838 |
| 44341.208333333336 | 19.916 |
| 44341.21875 | 19.878 |
| 44341.229166666664 | 19.962 |
| 44341.239583333336 | 20.017 |
| 44341.25 | 20.031 |
| 44341.260416666664 | 20.023 |
| 44341.270833333336 | 20.026 |
| 44341.28125 | 19.979 |
| 44341.291666666664 | 19.936 |
| 44341.302083333336 | 19.981 |
| 44341.3125 | 20.002 |
| 44341.322916666664 | 19.963 |
| 44341.333333333336 | 19.916 |
| 44341.34375 | 19.876 |
| 44341.354166666664 | 19.78 |
| 44341.364583333336 | 19.672 |
| 44341.375 | 19.589 |
| 44341.385416666664 | 19.535 |
| 44341.395833333336 | 19.453 |
| 44341.40625 | 19.382 |
| 44341.416666666664 | 19.356 |
| 44341.427083333336 | 19.357 |
| 44341.4375 | 19.386 |
| 44341.447916666664 | 19.465 |
| 44341.458333333336 | 19.568 |
| 44341.46875 | 19.634 |
| 44341.479166666664 | 19.697 |
| 44341.489583333336 | 19.678 |
| 44341.5 | 19.685 |
| 44341.510416666664 | 19.679 |
| 44341.520833333336 | 19.68 |
| 44341.53125 | 19.69 |
| 44341.541666666664 | 19.667 |
| 44341.552083333336 | 19.623 |
| 44341.5625 | 19.641 |
| 44341.572916666664 | 19.556 |
| 44341.583333333336 | 19.452 |
| 44341.59375 | 19.31 |
| 44341.604166666664 | 19.262 |
| 44341.614583333336 | 19.074 |
| 44341.625 | 19.052 |
| 44341.635416666664 | 19.096 |
| 44341.645833333336 | 19.116 |
| 44341.65625 | 19.192 |
| 44341.666666666664 | 19.216 |
| 44341.677083333336 | 19.303 |
| 44341.6875 | 19.489 |
| 44341.697916666664 | 19.566 |
| 44341.708333333336 | 19.648 |
| 44341.71875 | 19.797 |
| 44341.729166666664 | 19.885 |
| 44341.739583333336 | 20.004 |
| 44341.75 | 20.043 |
| 44341.760416666664 | 20.088 |
| 44341.770833333336 | 20.106 |
| 44341.78125 | 20.107 |
| 44341.791666666664 | 20.046 |
| 44341.802083333336 | 20.115 |
| 44341.8125 | 20.101 |
| 44341.822916666664 | 20.101 |
| 44341.833333333336 | 20.065 |
| 44341.84375 | 20.06 |
| 44341.854166666664 | 20.136 |
| 44341.864583333336 | 20.19 |
| 44341.875 | 20.318 |
| 44341.885416666664 | 20.374 |
| 44341.895833333336 | 20.446 |
| 44341.90625 | 20.506 |
| 44341.916666666664 | 20.53 |
| 44341.927083333336 | 20.446 |
| 44341.9375 | 20.389 |
| 44341.947916666664 | 20.338 |
| 44341.958333333336 | 20.269 |
| 44341.96875 | 20.209 |
| 44341.979166666664 | 20.181 |
| 44341.989583333336 | 20.149 |
| 44342.0 | 20.098 |
| 44342.010416666664 | 20.052 |
| 44342.020833333336 | 20.054 |
| 44342.03125 | 20.032 |
| 44342.041666666664 | 19.932 |
| 44342.052083333336 | 20.028 |
| 44342.0625 | 20.066 |
| 44342.072916666664 | 20.017 |
| 44342.083333333336 | 19.917 |
| 44342.09375 | 19.982 |
| 44342.104166666664 | 20.035 |
| 44342.114583333336 | 20.046 |
| 44342.125 | 20.059 |
| 44342.135416666664 | 20.065 |
| 44342.145833333336 | 20.077 |
| 44342.15625 | 20.053 |
| 44342.166666666664 | 20.02 |
| 44342.177083333336 | 20.007 |
| 44342.1875 | 19.99 |
| 44342.197916666664 | 19.99 |
| 44342.208333333336 | 19.992 |
| 44342.21875 | 19.962 |
| 44342.229166666664 | 19.952 |
| 44342.239583333336 | 19.942 |
| 44342.25 | 19.952 |
| 44342.260416666664 | 19.957 |
| 44342.270833333336 | 19.966 |
| 44342.28125 | 19.971 |
| 44342.291666666664 | 19.972 |
| 44342.302083333336 | 19.966 |
| 44342.3125 | 19.963 |
| 44342.322916666664 | 19.942 |
| 44342.333333333336 | 19.937 |
| 44342.34375 | 19.941 |
| 44342.354166666664 | 19.95 |
| 44342.364583333336 | 19.941 |
| 44342.375 | 19.911 |
| 44342.385416666664 | 19.891 |
| 44342.395833333336 | 19.873 |
| 44342.40625 | 19.863 |
| 44342.416666666664 | 19.846 |
| 44342.427083333336 | 19.816 |
| 44342.4375 | 19.796 |
| 44342.447916666664 | 19.784 |
| 44342.458333333336 | 19.752 |
| 44342.46875 | 19.755 |
| 44342.479166666664 | 19.768 |
| 44342.489583333336 | 19.796 |
| 44342.5 | 19.803 |
| 44342.510416666664 | 19.802 |
| 44342.520833333336 | 19.807 |
| 44342.53125 | 19.808 |
| 44342.541666666664 | 19.834 |
| 44342.552083333336 | 19.859 |
| 44342.5625 | 20.014 |
| 44342.572916666664 | 20.1 |
| 44342.583333333336 | 20.173 |
| 44342.59375 | 20.641 |
| 44342.604166666664 | 21.103 |
| 44342.614583333336 | 21.499 |
| 44342.625 | 21.745 |
| 44342.635416666664 | 21.97 |
| 44342.645833333336 | 22.159 |
| 44342.65625 | 22.256 |
| 44342.666666666664 | 22.178 |
| 44342.677083333336 | 22.383 |
| 44342.6875 | 22.883 |
| 44342.697916666664 | 23.09 |
| 44342.708333333336 | 23.445 |
| 44342.71875 | 23.725 |
| 44342.729166666664 | 23.886 |
| 44342.739583333336 | 24.161 |
| 44342.75 | 24.066 |
| 44342.760416666664 | 24.341 |
| 44342.770833333336 | 24.692 |
| 44342.78125 | 24.594 |
| 44342.791666666664 | 24.778 |
| 44342.802083333336 | 24.722 |
| 44342.8125 | 25.157 |
| 44342.822916666664 | 24.99 |
| 44342.833333333336 | 24.763 |
| 44342.84375 | 24.595 |
| 44342.854166666664 | 24.591 |
| 44342.864583333336 | 24.609 |
| 44342.875 | 24.971 |
| 44342.885416666664 | 25.061 |
| 44342.895833333336 | 25.149 |
| 44342.90625 | 25.386 |
| 44342.916666666664 | 25.608 |
| 44342.927083333336 | 25.683 |
| 44342.9375 | 25.62 |
| 44342.947916666664 | 25.293 |
| 44342.958333333336 | 25.099 |
| 44342.96875 | 24.69 |
| 44342.979166666664 | 24.028 |
| 44342.989583333336 | 23.885 |
| 44343.0 | 23.781 |
| 44343.010416666664 | 23.722 |
| 44343.020833333336 | 23.669 |
| 44343.03125 | 23.505 |
| 44343.041666666664 | 23.385 |
| 44343.052083333336 | 23.242 |
| 44343.0625 | 22.856 |
| 44343.072916666664 | 23.002 |
| 44343.083333333336 | 23.173 |
| 44343.09375 | 23.379 |
| 44343.104166666664 | 23.245 |
| 44343.114583333336 | 23.065 |
| 44343.125 | 23.198 |
| 44343.135416666664 | 23.259 |
| 44343.145833333336 | 23.399 |
| 44343.15625 | 23.542 |
| 44343.166666666664 | 23.59 |
| 44343.177083333336 | 23.637 |
| 44343.1875 | 23.719 |
| 44343.197916666664 | 23.766 |
| 44343.208333333336 | 23.796 |
| 44343.21875 | 23.878 |
| 44343.229166666664 | 23.944 |
| 44343.239583333336 | 23.985 |
| 44343.25 | 24.025 |
| 44343.260416666664 | 24.08 |
| 44343.270833333336 | 24.09 |
| 44343.28125 | 23.97 |
| 44343.291666666664 | 24.117 |
| 44343.302083333336 | 24.126 |
| 44343.3125 | 24.119 |
| 44343.322916666664 | 24.056 |
| 44343.333333333336 | 23.969 |
| 44343.34375 | 23.907 |
| 44343.354166666664 | 23.894 |
| 44343.364583333336 | 23.906 |
| 44343.375 | 23.852 |
| 44343.385416666664 | 23.872 |
| 44343.395833333336 | 23.931 |
| 44343.40625 | 23.946 |
| 44343.416666666664 | 23.894 |
| 44343.427083333336 | 23.851 |
| 44343.4375 | 23.741 |
| 44343.447916666664 | 23.537 |
| 44343.458333333336 | 23.335 |
| 44343.46875 | 23.197 |
| 44343.479166666664 | 23.047 |
| 44343.489583333336 | 22.87 |
| 44343.5 | 22.688 |
| 44343.510416666664 | 22.541 |
| 44343.520833333336 | 22.56 |
| 44343.53125 | 22.535 |
| 44343.541666666664 | 22.439 |
| 44343.552083333336 | 22.356 |
| 44343.5625 | 22.392 |
| 44343.572916666664 | 22.385 |
| 44343.583333333336 | 22.483 |
| 44343.59375 | 22.828 |
| 44343.604166666664 | 22.852 |
| 44343.614583333336 | 22.91 |
| 44343.625 | 23.115 |
| 44343.635416666664 | 23.29 |
| 44343.645833333336 | 23.472 |
| 44343.65625 | 24.011 |
| 44343.666666666664 | 24.139 |
| 44343.677083333336 | 24.52 |
| 44343.6875 | 24.567 |
| 44343.697916666664 | 24.863 |
| 44343.708333333336 | 25.27 |
| 44343.71875 | 25.798 |
| 44343.729166666664 | 26.173 |
| 44343.739583333336 | 26.549 |
| 44343.75 | 26.786 |
| 44343.760416666664 | 27.026 |
| 44343.770833333336 | 27.296 |
| 44343.78125 | 27.494 |
| 44343.791666666664 | 27.654 |
| 44343.802083333336 | 27.715 |
| 44343.8125 | 27.604 |
| 44343.822916666664 | 27.74 |
| 44343.833333333336 | 27.702 |
| 44343.84375 | 27.781 |
| 44343.854166666664 | 27.75 |
| 44343.864583333336 | 27.598 |
| 44343.875 | 27.525 |
| 44343.885416666664 | 27.379 |
| 44343.895833333336 | 27.282 |
| 44343.90625 | 27.184 |
| 44343.916666666664 | 27.101 |
| 44343.927083333336 | 27.043 |
| 44343.9375 | 27.074 |
| 44343.947916666664 | 27.03 |
| 44343.958333333336 | 26.913 |
| 44343.96875 | 26.816 |
| 44343.979166666664 | 26.608 |
| 44343.989583333336 | 26.21 |
| 44344.0 | 25.847 |
| 44344.010416666664 | 25.386 |
| 44344.020833333336 | 25.29 |
| 44344.03125 | 25.106 |
| 44344.041666666664 | 25.073 |
| 44344.052083333336 | 25.125 |
| 44344.0625 | 25.06 |
| 44344.072916666664 | 24.923 |
| 44344.083333333336 | 24.823 |
| 44344.09375 | 24.641 |
| 44344.104166666664 | 24.525 |
| 44344.114583333336 | 24.549 |
| 44344.125 | 24.517 |
| 44344.135416666664 | 24.526 |
| 44344.145833333336 | 24.385 |
| 44344.15625 | 24.434 |
| 44344.166666666664 | 24.419 |
| 44344.177083333336 | 24.487 |
| 44344.1875 | 24.443 |
| 44344.197916666664 | 24.473 |
| 44344.208333333336 | 24.36 |
| 44344.21875 | 24.445 |
| 44344.229166666664 | 24.355 |
| 44344.239583333336 | 24.393 |
| 44344.25 | 24.383 |
| 44344.260416666664 | 24.517 |
| 44344.270833333336 | 24.579 |
| 44344.28125 | 24.841 |
| 44344.291666666664 | 24.993 |
| 44344.302083333336 | 25.12 |
| 44344.3125 | 25.187 |
| 44344.322916666664 | 25.285 |
| 44344.333333333336 | 25.333 |
| 44344.34375 | 25.331 |
| 44344.354166666664 | 25.309 |
| 44344.364583333336 | 25.319 |
| 44344.375 | 25.283 |
| 44344.385416666664 | 25.223 |
| 44344.395833333336 | 25.19 |
| 44344.40625 | 25.213 |
| 44344.416666666664 | 25.221 |
| 44344.427083333336 | 25.18 |
| 44344.4375 | 25.136 |
| 44344.447916666664 | 25.005 |
| 44344.458333333336 | 24.875 |
| 44344.46875 | 24.656 |
| 44344.479166666664 | 24.52 |
| 44344.489583333336 | 24.327 |
| 44344.5 | 24.205 |
| 44344.510416666664 | 24.093 |
| 44344.520833333336 | 23.982 |
| 44344.53125 | 23.779 |
| 44344.541666666664 | 23.644 |
| 44344.552083333336 | 23.676 |
| 44344.5625 | 23.62 |
| 44344.572916666664 | 23.55 |
| 44344.583333333336 | 23.497 |
| 44344.59375 | 23.476 |
| 44344.604166666664 | 23.507 |
| 44344.614583333336 | 23.551 |
| 44344.625 | 23.648 |
| 44344.635416666664 | 23.79 |
| 44344.645833333336 | 24.153 |
| 44344.65625 | 24.351 |
| 44344.666666666664 | 24.628 |
| 44344.677083333336 | 24.833 |
| 44344.6875 | 25.381 |
| 44344.697916666664 | 25.553 |
| 44344.708333333336 | 25.363 |
| 44344.71875 | 26.095 |
| 44344.729166666664 | 25.841 |
| 44344.739583333336 | 26.306 |
| 44344.75 | 26.624 |
| 44344.760416666664 | 26.479 |
| 44344.770833333336 | 26.597 |
| 44344.78125 | 26.928 |
| 44344.791666666664 | 27.282 |
| 44344.802083333336 | 27.474 |
| 44344.8125 | 27.521 |
| 44344.822916666664 | 27.665 |
| 44344.833333333336 | 27.524 |
| 44344.84375 | 27.449 |
| 44344.854166666664 | 27.457 |
| 44344.864583333336 | 27.501 |
| 44344.875 | 27.534 |
| 44344.885416666664 | 27.499 |
| 44344.895833333336 | 27.465 |
| 44344.90625 | 27.453 |
| 44344.916666666664 | 27.321 |
| 44344.927083333336 | 27.252 |
| 44344.9375 | 27.053 |
| 44344.947916666664 | 26.859 |
| 44344.958333333336 | 26.689 |
| 44344.96875 | 26.456 |
| 44344.979166666664 | 26.366 |
| 44344.989583333336 | 26.208 |
| 44345.0 | 26.035 |
| 44345.010416666664 | 25.838 |
| 44345.020833333336 | 25.513 |
| 44345.03125 | 25.39 |
| 44345.041666666664 | 25.274 |
| 44345.052083333336 | 25.145 |
| 44345.0625 | 25.072 |
| 44345.072916666664 | 25.073 |
| 44345.083333333336 | 25.138 |
| 44345.09375 | 25.173 |
| 44345.104166666664 | 25.123 |
| 44345.114583333336 | 25.081 |
| 44345.125 | 25.007 |
| 44345.135416666664 | 24.879 |
| 44345.145833333336 | 24.669 |
| 44345.15625 | 24.677 |
| 44345.166666666664 | 24.465 |
| 44345.177083333336 | 24.823 |
| 44345.1875 | 24.495 |
| 44345.197916666664 | 24.658 |
| 44345.208333333336 | 24.78 |
| 44345.21875 | 24.802 |
| 44345.229166666664 | 24.767 |
| 44345.239583333336 | 24.745 |
| 44345.25 | 24.607 |
| 44345.260416666664 | 24.56 |
| 44345.270833333336 | 24.549 |
| 44345.28125 | 24.616 |
| 44345.291666666664 | 24.471 |
| 44345.302083333336 | 24.473 |
| 44345.3125 | 24.46 |
| 44345.322916666664 | 24.432 |
| 44345.333333333336 | 24.414 |
| 44345.34375 | 24.365 |
| 44345.354166666664 | 24.409 |
| 44345.364583333336 | 24.353 |
| 44345.375 | 24.482 |
| 44345.385416666664 | 24.662 |
| 44345.395833333336 | 24.706 |
| 44345.40625 | 24.882 |
| 44345.416666666664 | 24.876 |
| 44345.427083333336 | 24.886 |
| 44345.4375 | 24.751 |
| 44345.447916666664 | 24.779 |
| 44345.458333333336 | 24.804 |
| 44345.46875 | 24.764 |
| 44345.479166666664 | 24.677 |
| 44345.489583333336 | 24.609 |
| 44345.5 | 24.311 |
| 44345.510416666664 | 23.932 |
| 44345.520833333336 | 23.941 |
| 44345.53125 | 23.892 |
| 44345.541666666664 | 23.678 |
| 44345.552083333336 | 23.516 |
| 44345.5625 | 23.335 |
| 44345.572916666664 | 23.338 |
| 44345.583333333336 | 23.315 |
| 44345.59375 | 23.167 |
| 44345.604166666664 | 23.091 |
| 44345.614583333336 | 22.999 |
| 44345.625 | 22.88 |
| 44345.635416666664 | 22.826 |
| 44345.645833333336 | 22.733 |
| 44345.65625 | 22.619 |
| 44345.666666666664 | 22.863 |
| 44345.677083333336 | 22.975 |
| 44345.6875 | 22.876 |
| 44345.697916666664 | 22.71 |
| 44345.708333333336 | 22.638 |
| 44345.71875 | 22.539 |
| 44345.729166666664 | 22.387 |
| 44345.739583333336 | 22.307 |
| 44345.75 | 22.173 |
| 44345.760416666664 | 22.208 |
| 44345.770833333336 | 21.89 |
| 44345.78125 | 21.658 |
| 44345.791666666664 | 21.685 |
| 44345.802083333336 | 21.34 |
| 44345.8125 | 21.349 |
| 44345.822916666664 | 21.208 |
| 44345.833333333336 | 20.929 |
| 44345.84375 | 20.746 |
| 44345.854166666664 | 20.748 |
| 44345.864583333336 | 20.649 |
| 44345.875 | 20.42 |
| 44345.885416666664 | 20.239 |
| 44345.895833333336 | 20.385 |
| 44345.90625 | 20.396 |
| 44345.916666666664 | 20.562 |
| 44345.927083333336 | 20.887 |
| 44345.9375 | 21.069 |
| 44345.947916666664 | 21.07 |
| 44345.958333333336 | 21.03 |
| 44345.96875 | 20.927 |
| 44345.979166666664 | 20.95 |
| 44345.989583333336 | 20.908 |
| 44346.0 | 20.836 |
| 44346.010416666664 | 20.691 |
| 44346.020833333336 | 20.519 |
| 44346.03125 | 20.321 |
| 44346.041666666664 | 20.106 |
| 44346.052083333336 | 19.92 |
| 44346.0625 | 19.845 |
| 44346.072916666664 | 19.71 |
| 44346.083333333336 | 19.617 |
| 44346.09375 | 19.547 |
| 44346.104166666664 | 19.509 |
| 44346.114583333336 | 19.504 |
| 44346.125 | 19.489 |
| 44346.135416666664 | 19.455 |
| 44346.145833333336 | 19.467 |
| 44346.15625 | 19.452 |
| 44346.166666666664 | 19.474 |
| 44346.177083333336 | 19.204 |
| 44346.1875 | 19.055 |
| 44346.197916666664 | 18.933 |
| 44346.208333333336 | 18.788 |
| 44346.21875 | 18.694 |
| 44346.229166666664 | 18.606 |
| 44346.239583333336 | 18.564 |
| 44346.25 | 18.559 |
| 44346.260416666664 | 18.441 |
| 44346.270833333336 | 18.396 |
| 44346.28125 | 18.287 |
| 44346.291666666664 | 18.284 |
| 44346.302083333336 | 18.197 |
| 44346.3125 | 18.111 |
| 44346.322916666664 | 18.068 |
| 44346.333333333336 | 17.964 |
| 44346.34375 | 17.963 |
| 44346.354166666664 | 17.809 |
| 44346.364583333336 | 17.739 |
| 44346.375 | 17.763 |
| 44346.385416666664 | 17.574 |
| 44346.395833333336 | 17.663 |
| 44346.40625 | 17.529 |
| 44346.416666666664 | 17.378 |
| 44346.427083333336 | 17.448 |
| 44346.4375 | 17.334 |
| 44346.447916666664 | 17.252 |
| 44346.458333333336 | 17.316 |
| 44346.46875 | 17.289 |
| 44346.479166666664 | 17.602 |
| 44346.489583333336 | 17.657 |
| 44346.5 | 17.694 |
| 44346.510416666664 | 17.536 |
| 44346.520833333336 | 17.591 |
| 44346.53125 | 17.638 |
| 44346.541666666664 | 17.63 |
| 44346.552083333336 | 17.577 |
| 44346.5625 | 17.455 |
| 44346.572916666664 | 17.38 |
| 44346.583333333336 | 17.325 |
| 44346.59375 | 17.298 |
| 44346.604166666664 | 17.28 |
| 44346.614583333336 | 17.268 |
| 44346.625 | 17.276 |
| 44346.635416666664 | 17.284 |
| 44346.645833333336 | 17.299 |
| 44346.65625 | 17.33 |
| 44346.666666666664 | 17.363 |
| 44346.677083333336 | 17.379 |
| 44346.6875 | 17.372 |
| 44346.697916666664 | 17.377 |
| 44346.708333333336 | 17.408 |
| 44346.71875 | 17.488 |
| 44346.729166666664 | 17.504 |
| 44346.739583333336 | 17.406 |
| 44346.75 | 17.429 |
| 44346.760416666664 | 17.415 |
| 44346.770833333336 | 17.407 |
| 44346.78125 | 17.418 |
| 44346.791666666664 | 17.386 |
| 44346.802083333336 | 17.388 |
| 44346.8125 | 17.402 |
| 44346.822916666664 | 17.382 |
| 44346.833333333336 | 17.388 |
| 44346.84375 | 17.393 |
| 44346.854166666664 | 17.414 |
| 44346.864583333336 | 17.494 |
| 44346.875 | 17.454 |
| 44346.885416666664 | 17.51 |
| 44346.895833333336 | 17.44 |
| 44346.90625 | 17.45 |
| 44346.916666666664 | 17.454 |
| 44346.927083333336 | 17.456 |
| 44346.9375 | 17.446 |
| 44346.947916666664 | 17.416 |
| 44346.958333333336 | 17.42 |
| 44346.96875 | 17.373 |
| 44346.979166666664 | 17.39 |
| 44346.989583333336 | 17.391 |
| 44347.0 | 17.379 |
| 44347.010416666664 | 17.371 |
| 44347.020833333336 | 17.338 |
| 44347.03125 | 17.277 |
| 44347.041666666664 | 17.208 |
| 44347.052083333336 | 17.159 |
| 44347.0625 | 17.142 |
| 44347.072916666664 | 17.114 |
| 44347.083333333336 | 17.079 |
| 44347.09375 | 17.061 |
| 44347.104166666664 | 17.054 |
| 44347.114583333336 | 17.043 |
| 44347.125 | 17.036 |
| 44347.135416666664 | 17.037 |
| 44347.145833333336 | 17.046 |
| 44347.15625 | 17.057 |
| 44347.166666666664 | 17.064 |
| 44347.177083333336 | 17.063 |
| 44347.1875 | 17.062 |
| 44347.197916666664 | 17.06 |
| 44347.208333333336 | 17.06 |
| 44347.21875 | 17.062 |
| 44347.229166666664 | 17.057 |
| 44347.239583333336 | 17.067 |
| 44347.25 | 17.087 |
| 44347.260416666664 | 17.021 |
| 44347.270833333336 | 16.981 |
| 44347.28125 | 16.939 |
| 44347.291666666664 | 16.931 |
| 44347.302083333336 | 16.929 |
| 44347.3125 | 16.873 |
| 44347.322916666664 | 16.788 |
| 44347.333333333336 | 16.747 |
| 44347.34375 | 16.76 |
| 44347.354166666664 | 16.61 |
| 44347.364583333336 | 16.513 |
| 44347.375 | 16.579 |
| 44347.385416666664 | 16.435 |
| 44347.395833333336 | 16.413 |
| 44347.40625 | 16.392 |
| 44347.416666666664 | 16.349 |
| 44347.427083333336 | 16.421 |
| 44347.4375 | 16.335 |
| 44347.447916666664 | 16.381 |
| 44347.458333333336 | 16.403 |
| 44347.46875 | 16.408 |
| 44347.479166666664 | 16.47 |
| 44347.489583333336 | 16.484 |
| 44347.5 | 16.523 |
| 44347.510416666664 | 16.539 |
| 44347.520833333336 | 16.6 |
| 44347.53125 | 16.61 |
| 44347.541666666664 | 16.624 |
| 44347.552083333336 | 16.659 |
| 44347.5625 | 16.693 |
| 44347.572916666664 | 16.716 |
| 44347.583333333336 | 16.739 |
| 44347.59375 | 16.805 |
| 44347.604166666664 | 16.982 |
| 44347.614583333336 | 17.085 |
| 44347.625 | 17.208 |
| 44347.635416666664 | 17.295 |
| 44347.645833333336 | 17.393 |
| 44347.65625 | 17.501 |
| 44347.666666666664 | 17.596 |
| 44347.677083333336 | 17.685 |
| 44347.6875 | 17.789 |
| 44347.697916666664 | 17.868 |
| 44347.708333333336 | 17.989 |
| 44347.71875 | 18.054 |
| 44347.729166666664 | 18.124 |
| 44347.739583333336 | 18.202 |
| 44347.75 | 18.235 |
| 44347.760416666664 | 18.154 |
| 44347.770833333336 | 18.588 |
| 44347.78125 | 18.851 |
| 44347.791666666664 | 19.203 |
| 44347.802083333336 | 19.606 |
| 44347.8125 | 19.96 |
| 44347.822916666664 | 20.353 |
| 44347.833333333336 | 20.658 |
| 44347.84375 | 20.91 |
| 44347.854166666664 | 20.808 |
| 44347.864583333336 | 21.06 |
| 44347.875 | 20.744 |
| 44347.885416666664 | 20.659 |
| 44347.895833333336 | 20.702 |
| 44347.90625 | 20.848 |
| 44347.916666666664 | 21.024 |
| 44347.927083333336 | 21.192 |
| 44347.9375 | 21.224 |
| 44347.947916666664 | 21.385 |
| 44347.958333333336 | 21.274 |
| 44347.96875 | 21.036 |
| 44347.979166666664 | 20.937 |
| 44347.989583333336 | 20.923 |
| 44348.0 | 20.89 |
| 44348.010416666664 | 20.859 |
| 44348.020833333336 | 20.83 |
| 44348.03125 | 20.762 |
| 44348.041666666664 | 20.684 |
| 44348.052083333336 | 20.665 |
| 44348.0625 | 20.579 |
| 44348.072916666664 | 20.454 |
| 44348.083333333336 | 20.311 |
| 44348.09375 | 20.143 |
| 44348.104166666664 | 19.982 |
| 44348.114583333336 | 19.83 |
| 44348.125 | 19.725 |
| 44348.135416666664 | 19.649 |
| 44348.145833333336 | 19.55 |
| 44348.15625 | 19.472 |